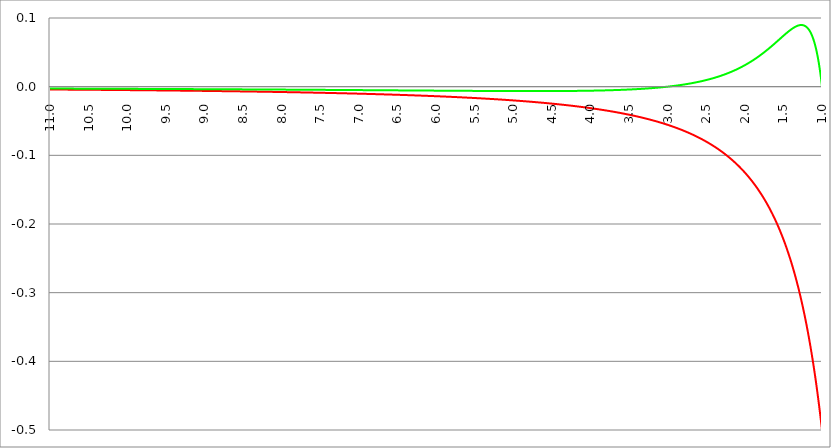
| Category | Series 1 | Series 0 | Series 2 |
|---|---|---|---|
| 11.0 | -0.004 | -0.003 |  |
| 10.995 | -0.004 | -0.003 |  |
| 10.99 | -0.004 | -0.003 |  |
| 10.985 | -0.004 | -0.003 |  |
| 10.98 | -0.004 | -0.003 |  |
| 10.975 | -0.004 | -0.003 |  |
| 10.97 | -0.004 | -0.003 |  |
| 10.96499999999999 | -0.004 | -0.003 |  |
| 10.96 | -0.004 | -0.003 |  |
| 10.955 | -0.004 | -0.003 |  |
| 10.95 | -0.004 | -0.003 |  |
| 10.945 | -0.004 | -0.003 |  |
| 10.94 | -0.004 | -0.003 |  |
| 10.93499999999999 | -0.004 | -0.003 |  |
| 10.92999999999999 | -0.004 | -0.003 |  |
| 10.92499999999999 | -0.004 | -0.003 |  |
| 10.91999999999999 | -0.004 | -0.003 |  |
| 10.91499999999999 | -0.004 | -0.003 |  |
| 10.90999999999999 | -0.004 | -0.003 |  |
| 10.90499999999999 | -0.004 | -0.003 |  |
| 10.89999999999998 | -0.004 | -0.003 |  |
| 10.89499999999998 | -0.004 | -0.003 |  |
| 10.88999999999998 | -0.004 | -0.003 |  |
| 10.88499999999998 | -0.004 | -0.003 |  |
| 10.87999999999998 | -0.004 | -0.003 |  |
| 10.87499999999998 | -0.004 | -0.003 |  |
| 10.86999999999998 | -0.004 | -0.003 |  |
| 10.86499999999998 | -0.004 | -0.003 |  |
| 10.85999999999998 | -0.004 | -0.003 |  |
| 10.85499999999998 | -0.004 | -0.003 |  |
| 10.84999999999998 | -0.004 | -0.003 |  |
| 10.84499999999998 | -0.004 | -0.003 |  |
| 10.83999999999997 | -0.004 | -0.003 |  |
| 10.83499999999997 | -0.004 | -0.003 |  |
| 10.82999999999997 | -0.004 | -0.003 |  |
| 10.82499999999997 | -0.004 | -0.003 |  |
| 10.81999999999997 | -0.004 | -0.003 |  |
| 10.81499999999997 | -0.004 | -0.003 |  |
| 10.80999999999997 | -0.004 | -0.003 |  |
| 10.80499999999997 | -0.004 | -0.003 |  |
| 10.79999999999997 | -0.004 | -0.003 |  |
| 10.79499999999997 | -0.004 | -0.003 |  |
| 10.78999999999997 | -0.004 | -0.003 |  |
| 10.78499999999997 | -0.004 | -0.003 |  |
| 10.77999999999997 | -0.004 | -0.003 |  |
| 10.77499999999996 | -0.004 | -0.003 |  |
| 10.76999999999996 | -0.004 | -0.003 |  |
| 10.76499999999996 | -0.004 | -0.003 |  |
| 10.75999999999996 | -0.004 | -0.003 |  |
| 10.75499999999996 | -0.004 | -0.003 |  |
| 10.74999999999996 | -0.004 | -0.003 |  |
| 10.74499999999996 | -0.004 | -0.003 |  |
| 10.73999999999996 | -0.004 | -0.003 |  |
| 10.73499999999996 | -0.004 | -0.003 |  |
| 10.72999999999996 | -0.004 | -0.003 |  |
| 10.72499999999996 | -0.004 | -0.003 |  |
| 10.71999999999996 | -0.004 | -0.003 |  |
| 10.71499999999996 | -0.004 | -0.003 |  |
| 10.70999999999995 | -0.004 | -0.003 |  |
| 10.70499999999995 | -0.004 | -0.003 |  |
| 10.69999999999995 | -0.004 | -0.003 |  |
| 10.69499999999995 | -0.004 | -0.003 |  |
| 10.68999999999995 | -0.004 | -0.003 |  |
| 10.68499999999995 | -0.004 | -0.003 |  |
| 10.67999999999995 | -0.004 | -0.003 |  |
| 10.67499999999995 | -0.004 | -0.003 |  |
| 10.66999999999995 | -0.004 | -0.003 |  |
| 10.66499999999995 | -0.004 | -0.003 |  |
| 10.65999999999995 | -0.004 | -0.003 |  |
| 10.65499999999995 | -0.004 | -0.003 |  |
| 10.64999999999995 | -0.004 | -0.003 |  |
| 10.64499999999994 | -0.004 | -0.003 |  |
| 10.63999999999994 | -0.004 | -0.003 |  |
| 10.63499999999994 | -0.004 | -0.003 |  |
| 10.62999999999994 | -0.004 | -0.003 |  |
| 10.62499999999994 | -0.004 | -0.003 |  |
| 10.61999999999994 | -0.004 | -0.003 |  |
| 10.61499999999994 | -0.004 | -0.003 |  |
| 10.60999999999994 | -0.004 | -0.003 |  |
| 10.60499999999994 | -0.004 | -0.003 |  |
| 10.59999999999994 | -0.004 | -0.003 |  |
| 10.59499999999994 | -0.004 | -0.003 |  |
| 10.58999999999994 | -0.004 | -0.003 |  |
| 10.58499999999994 | -0.004 | -0.003 |  |
| 10.57999999999993 | -0.004 | -0.003 |  |
| 10.57499999999993 | -0.004 | -0.003 |  |
| 10.56999999999993 | -0.004 | -0.003 |  |
| 10.56499999999993 | -0.004 | -0.003 |  |
| 10.55999999999993 | -0.004 | -0.003 |  |
| 10.55499999999993 | -0.004 | -0.003 |  |
| 10.54999999999993 | -0.004 | -0.003 |  |
| 10.54499999999993 | -0.004 | -0.003 |  |
| 10.53999999999993 | -0.005 | -0.003 |  |
| 10.53499999999993 | -0.005 | -0.003 |  |
| 10.52999999999993 | -0.005 | -0.003 |  |
| 10.52499999999993 | -0.005 | -0.003 |  |
| 10.51999999999992 | -0.005 | -0.003 |  |
| 10.51499999999992 | -0.005 | -0.003 |  |
| 10.50999999999992 | -0.005 | -0.003 |  |
| 10.50499999999992 | -0.005 | -0.003 |  |
| 10.49999999999992 | -0.005 | -0.003 |  |
| 10.49499999999992 | -0.005 | -0.003 |  |
| 10.48999999999992 | -0.005 | -0.003 |  |
| 10.48499999999992 | -0.005 | -0.003 |  |
| 10.47999999999992 | -0.005 | -0.003 |  |
| 10.47499999999992 | -0.005 | -0.003 |  |
| 10.46999999999992 | -0.005 | -0.003 |  |
| 10.46499999999992 | -0.005 | -0.003 |  |
| 10.45999999999992 | -0.005 | -0.003 |  |
| 10.45499999999991 | -0.005 | -0.003 |  |
| 10.44999999999991 | -0.005 | -0.003 |  |
| 10.44499999999991 | -0.005 | -0.003 |  |
| 10.43999999999991 | -0.005 | -0.003 |  |
| 10.43499999999991 | -0.005 | -0.003 |  |
| 10.42999999999991 | -0.005 | -0.003 |  |
| 10.42499999999991 | -0.005 | -0.003 |  |
| 10.41999999999991 | -0.005 | -0.003 |  |
| 10.41499999999991 | -0.005 | -0.003 |  |
| 10.40999999999991 | -0.005 | -0.003 |  |
| 10.40499999999991 | -0.005 | -0.003 |  |
| 10.39999999999991 | -0.005 | -0.003 |  |
| 10.39499999999991 | -0.005 | -0.003 |  |
| 10.3899999999999 | -0.005 | -0.003 |  |
| 10.3849999999999 | -0.005 | -0.003 |  |
| 10.3799999999999 | -0.005 | -0.003 |  |
| 10.3749999999999 | -0.005 | -0.003 |  |
| 10.3699999999999 | -0.005 | -0.003 |  |
| 10.3649999999999 | -0.005 | -0.003 |  |
| 10.3599999999999 | -0.005 | -0.003 |  |
| 10.3549999999999 | -0.005 | -0.003 |  |
| 10.3499999999999 | -0.005 | -0.003 |  |
| 10.3449999999999 | -0.005 | -0.003 |  |
| 10.3399999999999 | -0.005 | -0.003 |  |
| 10.3349999999999 | -0.005 | -0.003 |  |
| 10.3299999999999 | -0.005 | -0.003 |  |
| 10.32499999999989 | -0.005 | -0.003 |  |
| 10.31999999999989 | -0.005 | -0.003 |  |
| 10.31499999999989 | -0.005 | -0.003 |  |
| 10.3099999999999 | -0.005 | -0.003 |  |
| 10.3049999999999 | -0.005 | -0.003 |  |
| 10.2999999999999 | -0.005 | -0.003 |  |
| 10.29499999999989 | -0.005 | -0.003 |  |
| 10.28999999999989 | -0.005 | -0.003 |  |
| 10.28499999999989 | -0.005 | -0.003 |  |
| 10.27999999999989 | -0.005 | -0.003 |  |
| 10.27499999999989 | -0.005 | -0.003 |  |
| 10.26999999999989 | -0.005 | -0.003 |  |
| 10.26499999999989 | -0.005 | -0.003 |  |
| 10.25999999999988 | -0.005 | -0.003 |  |
| 10.25499999999988 | -0.005 | -0.003 |  |
| 10.24999999999988 | -0.005 | -0.003 |  |
| 10.24499999999988 | -0.005 | -0.003 |  |
| 10.23999999999988 | -0.005 | -0.003 |  |
| 10.23499999999988 | -0.005 | -0.003 |  |
| 10.22999999999988 | -0.005 | -0.003 |  |
| 10.22499999999988 | -0.005 | -0.003 |  |
| 10.21999999999988 | -0.005 | -0.003 |  |
| 10.21499999999988 | -0.005 | -0.003 |  |
| 10.20999999999988 | -0.005 | -0.003 |  |
| 10.20499999999988 | -0.005 | -0.003 |  |
| 10.19999999999987 | -0.005 | -0.003 |  |
| 10.19499999999987 | -0.005 | -0.003 |  |
| 10.18999999999987 | -0.005 | -0.003 |  |
| 10.18499999999987 | -0.005 | -0.003 |  |
| 10.17999999999987 | -0.005 | -0.003 |  |
| 10.17499999999987 | -0.005 | -0.003 |  |
| 10.16999999999987 | -0.005 | -0.003 |  |
| 10.16499999999987 | -0.005 | -0.003 |  |
| 10.15999999999987 | -0.005 | -0.003 |  |
| 10.15499999999987 | -0.005 | -0.003 |  |
| 10.14999999999987 | -0.005 | -0.003 |  |
| 10.14499999999987 | -0.005 | -0.003 |  |
| 10.13999999999987 | -0.005 | -0.003 |  |
| 10.13499999999986 | -0.005 | -0.003 |  |
| 10.12999999999986 | -0.005 | -0.003 |  |
| 10.12499999999986 | -0.005 | -0.003 |  |
| 10.11999999999986 | -0.005 | -0.003 |  |
| 10.11499999999986 | -0.005 | -0.003 |  |
| 10.10999999999986 | -0.005 | -0.003 |  |
| 10.10499999999986 | -0.005 | -0.003 |  |
| 10.09999999999986 | -0.005 | -0.003 |  |
| 10.09499999999986 | -0.005 | -0.003 |  |
| 10.08999999999986 | -0.005 | -0.003 |  |
| 10.08499999999986 | -0.005 | -0.003 |  |
| 10.07999999999986 | -0.005 | -0.003 |  |
| 10.07499999999986 | -0.005 | -0.003 |  |
| 10.06999999999985 | -0.005 | -0.003 |  |
| 10.06499999999985 | -0.005 | -0.003 |  |
| 10.05999999999985 | -0.005 | -0.003 |  |
| 10.05499999999985 | -0.005 | -0.003 |  |
| 10.04999999999985 | -0.005 | -0.003 |  |
| 10.04499999999985 | -0.005 | -0.003 |  |
| 10.03999999999985 | -0.005 | -0.003 |  |
| 10.03499999999985 | -0.005 | -0.003 |  |
| 10.02999999999985 | -0.005 | -0.003 |  |
| 10.02499999999985 | -0.005 | -0.003 |  |
| 10.01999999999985 | -0.005 | -0.003 |  |
| 10.01499999999985 | -0.005 | -0.003 |  |
| 10.00999999999985 | -0.005 | -0.003 |  |
| 10.00499999999984 | -0.005 | -0.003 |  |
| 9.999999999999844 | -0.005 | -0.003 |  |
| 9.994999999999841 | -0.005 | -0.003 |  |
| 9.98999999999984 | -0.005 | -0.003 |  |
| 9.98499999999984 | -0.005 | -0.003 |  |
| 9.97999999999984 | -0.005 | -0.003 |  |
| 9.97499999999984 | -0.005 | -0.003 |  |
| 9.969999999999837 | -0.005 | -0.003 |  |
| 9.964999999999838 | -0.005 | -0.003 |  |
| 9.959999999999837 | -0.005 | -0.003 |  |
| 9.954999999999837 | -0.005 | -0.003 |  |
| 9.949999999999836 | -0.005 | -0.003 |  |
| 9.944999999999835 | -0.005 | -0.003 |  |
| 9.939999999999834 | -0.005 | -0.003 |  |
| 9.934999999999834 | -0.005 | -0.003 |  |
| 9.929999999999833 | -0.005 | -0.003 |  |
| 9.92499999999983 | -0.005 | -0.003 |  |
| 9.91999999999983 | -0.005 | -0.003 |  |
| 9.91499999999983 | -0.005 | -0.003 |  |
| 9.90999999999983 | -0.005 | -0.003 |  |
| 9.904999999999829 | -0.005 | -0.003 |  |
| 9.899999999999826 | -0.005 | -0.003 |  |
| 9.894999999999827 | -0.005 | -0.003 |  |
| 9.889999999999826 | -0.005 | -0.003 |  |
| 9.884999999999826 | -0.005 | -0.003 |  |
| 9.879999999999823 | -0.005 | -0.003 |  |
| 9.874999999999824 | -0.005 | -0.003 |  |
| 9.869999999999823 | -0.005 | -0.003 |  |
| 9.864999999999823 | -0.005 | -0.003 |  |
| 9.85999999999982 | -0.005 | -0.003 |  |
| 9.85499999999982 | -0.005 | -0.003 |  |
| 9.84999999999982 | -0.005 | -0.003 |  |
| 9.84499999999982 | -0.005 | -0.003 |  |
| 9.839999999999819 | -0.005 | -0.003 |  |
| 9.834999999999818 | -0.005 | -0.003 |  |
| 9.829999999999817 | -0.005 | -0.003 |  |
| 9.824999999999816 | -0.005 | -0.003 |  |
| 9.819999999999816 | -0.005 | -0.003 |  |
| 9.814999999999815 | -0.005 | -0.003 |  |
| 9.809999999999812 | -0.005 | -0.003 |  |
| 9.804999999999813 | -0.005 | -0.003 |  |
| 9.799999999999812 | -0.005 | -0.003 |  |
| 9.794999999999812 | -0.005 | -0.003 |  |
| 9.78999999999981 | -0.005 | -0.003 |  |
| 9.78499999999981 | -0.005 | -0.003 |  |
| 9.77999999999981 | -0.005 | -0.003 |  |
| 9.774999999999809 | -0.005 | -0.003 |  |
| 9.769999999999808 | -0.005 | -0.003 |  |
| 9.764999999999807 | -0.005 | -0.003 |  |
| 9.759999999999806 | -0.005 | -0.003 |  |
| 9.754999999999805 | -0.005 | -0.003 |  |
| 9.749999999999805 | -0.005 | -0.003 |  |
| 9.744999999999804 | -0.005 | -0.003 |  |
| 9.739999999999803 | -0.005 | -0.003 |  |
| 9.734999999999802 | -0.005 | -0.003 |  |
| 9.729999999999801 | -0.005 | -0.003 |  |
| 9.7249999999998 | -0.005 | -0.003 |  |
| 9.7199999999998 | -0.005 | -0.003 |  |
| 9.7149999999998 | -0.005 | -0.003 |  |
| 9.709999999999798 | -0.005 | -0.003 |  |
| 9.704999999999798 | -0.005 | -0.003 |  |
| 9.699999999999797 | -0.005 | -0.003 |  |
| 9.694999999999794 | -0.005 | -0.003 |  |
| 9.689999999999795 | -0.005 | -0.003 |  |
| 9.684999999999794 | -0.005 | -0.003 |  |
| 9.679999999999794 | -0.005 | -0.003 |  |
| 9.674999999999793 | -0.005 | -0.003 |  |
| 9.66999999999979 | -0.005 | -0.003 |  |
| 9.66499999999979 | -0.005 | -0.003 |  |
| 9.65999999999979 | -0.005 | -0.003 |  |
| 9.65499999999979 | -0.005 | -0.003 |  |
| 9.649999999999787 | -0.005 | -0.003 |  |
| 9.644999999999788 | -0.005 | -0.003 |  |
| 9.639999999999787 | -0.005 | -0.003 |  |
| 9.634999999999787 | -0.005 | -0.003 |  |
| 9.629999999999786 | -0.005 | -0.003 |  |
| 9.624999999999785 | -0.005 | -0.003 |  |
| 9.619999999999784 | -0.005 | -0.003 |  |
| 9.614999999999783 | -0.005 | -0.003 |  |
| 9.609999999999783 | -0.005 | -0.003 |  |
| 9.60499999999978 | -0.005 | -0.003 |  |
| 9.59999999999978 | -0.005 | -0.003 |  |
| 9.59499999999978 | -0.005 | -0.003 |  |
| 9.58999999999978 | -0.005 | -0.003 |  |
| 9.584999999999779 | -0.005 | -0.003 |  |
| 9.579999999999778 | -0.005 | -0.003 |  |
| 9.574999999999777 | -0.005 | -0.003 |  |
| 9.569999999999776 | -0.005 | -0.003 |  |
| 9.564999999999776 | -0.005 | -0.003 |  |
| 9.559999999999773 | -0.005 | -0.003 |  |
| 9.554999999999774 | -0.005 | -0.003 |  |
| 9.549999999999773 | -0.005 | -0.003 |  |
| 9.544999999999773 | -0.005 | -0.003 |  |
| 9.539999999999772 | -0.005 | -0.003 |  |
| 9.534999999999771 | -0.005 | -0.003 |  |
| 9.52999999999977 | -0.006 | -0.003 |  |
| 9.52499999999977 | -0.006 | -0.003 |  |
| 9.519999999999769 | -0.006 | -0.003 |  |
| 9.514999999999768 | -0.006 | -0.003 |  |
| 9.509999999999767 | -0.006 | -0.003 |  |
| 9.504999999999766 | -0.006 | -0.003 |  |
| 9.499999999999766 | -0.006 | -0.003 |  |
| 9.494999999999765 | -0.006 | -0.003 |  |
| 9.489999999999762 | -0.006 | -0.003 |  |
| 9.484999999999763 | -0.006 | -0.003 |  |
| 9.47999999999976 | -0.006 | -0.003 |  |
| 9.47499999999976 | -0.006 | -0.003 |  |
| 9.46999999999976 | -0.006 | -0.003 |  |
| 9.46499999999976 | -0.006 | -0.003 |  |
| 9.45999999999976 | -0.006 | -0.003 |  |
| 9.454999999999758 | -0.006 | -0.003 |  |
| 9.449999999999758 | -0.006 | -0.003 |  |
| 9.444999999999757 | -0.006 | -0.003 |  |
| 9.439999999999756 | -0.006 | -0.003 |  |
| 9.434999999999755 | -0.006 | -0.003 |  |
| 9.429999999999755 | -0.006 | -0.003 |  |
| 9.424999999999754 | -0.006 | -0.003 |  |
| 9.419999999999751 | -0.006 | -0.003 |  |
| 9.414999999999752 | -0.006 | -0.003 |  |
| 9.40999999999975 | -0.006 | -0.003 |  |
| 9.40499999999975 | -0.006 | -0.003 |  |
| 9.39999999999975 | -0.006 | -0.003 |  |
| 9.39499999999975 | -0.006 | -0.003 |  |
| 9.389999999999748 | -0.006 | -0.003 |  |
| 9.384999999999748 | -0.006 | -0.003 |  |
| 9.379999999999747 | -0.006 | -0.003 |  |
| 9.374999999999744 | -0.006 | -0.003 |  |
| 9.369999999999745 | -0.006 | -0.003 |  |
| 9.364999999999744 | -0.006 | -0.003 |  |
| 9.35999999999974 | -0.006 | -0.003 |  |
| 9.35499999999974 | -0.006 | -0.003 |  |
| 9.34999999999974 | -0.006 | -0.003 |  |
| 9.34499999999974 | -0.006 | -0.003 |  |
| 9.33999999999974 | -0.006 | -0.003 |  |
| 9.33499999999974 | -0.006 | -0.003 |  |
| 9.329999999999737 | -0.006 | -0.003 |  |
| 9.324999999999738 | -0.006 | -0.003 |  |
| 9.319999999999737 | -0.006 | -0.003 |  |
| 9.314999999999737 | -0.006 | -0.003 |  |
| 9.309999999999736 | -0.006 | -0.003 |  |
| 9.304999999999733 | -0.006 | -0.003 |  |
| 9.299999999999734 | -0.006 | -0.003 |  |
| 9.294999999999733 | -0.006 | -0.003 |  |
| 9.289999999999733 | -0.006 | -0.004 |  |
| 9.28499999999973 | -0.006 | -0.004 |  |
| 9.27999999999973 | -0.006 | -0.004 |  |
| 9.27499999999973 | -0.006 | -0.004 |  |
| 9.26999999999973 | -0.006 | -0.004 |  |
| 9.264999999999729 | -0.006 | -0.004 |  |
| 9.259999999999726 | -0.006 | -0.004 |  |
| 9.254999999999727 | -0.006 | -0.004 |  |
| 9.249999999999726 | -0.006 | -0.004 |  |
| 9.244999999999726 | -0.006 | -0.004 |  |
| 9.239999999999725 | -0.006 | -0.004 |  |
| 9.234999999999724 | -0.006 | -0.004 |  |
| 9.229999999999723 | -0.006 | -0.004 |  |
| 9.224999999999723 | -0.006 | -0.004 |  |
| 9.219999999999722 | -0.006 | -0.004 |  |
| 9.214999999999721 | -0.006 | -0.004 |  |
| 9.20999999999972 | -0.006 | -0.004 |  |
| 9.20499999999972 | -0.006 | -0.004 |  |
| 9.199999999999719 | -0.006 | -0.004 |  |
| 9.194999999999718 | -0.006 | -0.004 |  |
| 9.189999999999717 | -0.006 | -0.004 |  |
| 9.184999999999716 | -0.006 | -0.004 |  |
| 9.179999999999715 | -0.006 | -0.004 |  |
| 9.174999999999715 | -0.006 | -0.004 |  |
| 9.169999999999712 | -0.006 | -0.004 |  |
| 9.164999999999713 | -0.006 | -0.004 |  |
| 9.15999999999971 | -0.006 | -0.004 |  |
| 9.15499999999971 | -0.006 | -0.004 |  |
| 9.14999999999971 | -0.006 | -0.004 |  |
| 9.14499999999971 | -0.006 | -0.004 |  |
| 9.13999999999971 | -0.006 | -0.004 |  |
| 9.134999999999708 | -0.006 | -0.004 |  |
| 9.129999999999708 | -0.006 | -0.004 |  |
| 9.124999999999707 | -0.006 | -0.004 |  |
| 9.119999999999706 | -0.006 | -0.004 |  |
| 9.114999999999705 | -0.006 | -0.004 |  |
| 9.109999999999705 | -0.006 | -0.004 |  |
| 9.104999999999704 | -0.006 | -0.004 |  |
| 9.099999999999701 | -0.006 | -0.004 |  |
| 9.094999999999702 | -0.006 | -0.004 |  |
| 9.0899999999997 | -0.006 | -0.004 |  |
| 9.0849999999997 | -0.006 | -0.004 |  |
| 9.0799999999997 | -0.006 | -0.004 |  |
| 9.0749999999997 | -0.006 | -0.004 |  |
| 9.069999999999698 | -0.006 | -0.004 |  |
| 9.064999999999698 | -0.006 | -0.004 |  |
| 9.059999999999697 | -0.006 | -0.004 |  |
| 9.054999999999694 | -0.006 | -0.004 |  |
| 9.049999999999695 | -0.006 | -0.004 |  |
| 9.044999999999694 | -0.006 | -0.004 |  |
| 9.039999999999694 | -0.006 | -0.004 |  |
| 9.034999999999693 | -0.006 | -0.004 |  |
| 9.02999999999969 | -0.006 | -0.004 |  |
| 9.02499999999969 | -0.006 | -0.004 |  |
| 9.01999999999969 | -0.006 | -0.004 |  |
| 9.01499999999969 | -0.006 | -0.004 |  |
| 9.009999999999687 | -0.006 | -0.004 |  |
| 9.004999999999688 | -0.006 | -0.004 |  |
| 8.999999999999687 | -0.006 | -0.004 |  |
| 8.994999999999687 | -0.006 | -0.004 |  |
| 8.989999999999686 | -0.006 | -0.004 |  |
| 8.984999999999683 | -0.006 | -0.004 |  |
| 8.979999999999684 | -0.006 | -0.004 |  |
| 8.974999999999683 | -0.006 | -0.004 |  |
| 8.96999999999968 | -0.006 | -0.004 |  |
| 8.96499999999968 | -0.006 | -0.004 |  |
| 8.95999999999968 | -0.006 | -0.004 |  |
| 8.95499999999968 | -0.006 | -0.004 |  |
| 8.94999999999968 | -0.006 | -0.004 |  |
| 8.944999999999679 | -0.006 | -0.004 |  |
| 8.939999999999676 | -0.006 | -0.004 |  |
| 8.934999999999677 | -0.006 | -0.004 |  |
| 8.929999999999676 | -0.006 | -0.004 |  |
| 8.924999999999676 | -0.006 | -0.004 |  |
| 8.919999999999675 | -0.006 | -0.004 |  |
| 8.914999999999674 | -0.006 | -0.004 |  |
| 8.909999999999673 | -0.006 | -0.004 |  |
| 8.904999999999673 | -0.006 | -0.004 |  |
| 8.89999999999967 | -0.006 | -0.004 |  |
| 8.89499999999967 | -0.006 | -0.004 |  |
| 8.88999999999967 | -0.006 | -0.004 |  |
| 8.88499999999967 | -0.006 | -0.004 |  |
| 8.879999999999669 | -0.006 | -0.004 |  |
| 8.874999999999668 | -0.006 | -0.004 |  |
| 8.869999999999665 | -0.006 | -0.004 |  |
| 8.864999999999666 | -0.006 | -0.004 |  |
| 8.859999999999665 | -0.006 | -0.004 |  |
| 8.854999999999665 | -0.006 | -0.004 |  |
| 8.849999999999662 | -0.006 | -0.004 |  |
| 8.844999999999663 | -0.006 | -0.004 |  |
| 8.83999999999966 | -0.006 | -0.004 |  |
| 8.83499999999966 | -0.006 | -0.004 |  |
| 8.82999999999966 | -0.006 | -0.004 |  |
| 8.82499999999966 | -0.006 | -0.004 |  |
| 8.81999999999966 | -0.006 | -0.004 |  |
| 8.814999999999658 | -0.006 | -0.004 |  |
| 8.809999999999658 | -0.006 | -0.004 |  |
| 8.804999999999657 | -0.006 | -0.004 |  |
| 8.799999999999656 | -0.006 | -0.004 |  |
| 8.794999999999655 | -0.006 | -0.004 |  |
| 8.789999999999655 | -0.006 | -0.004 |  |
| 8.784999999999654 | -0.006 | -0.004 |  |
| 8.779999999999651 | -0.006 | -0.004 |  |
| 8.774999999999652 | -0.006 | -0.004 |  |
| 8.76999999999965 | -0.007 | -0.004 |  |
| 8.76499999999965 | -0.007 | -0.004 |  |
| 8.75999999999965 | -0.007 | -0.004 |  |
| 8.754999999999647 | -0.007 | -0.004 |  |
| 8.749999999999648 | -0.007 | -0.004 |  |
| 8.744999999999647 | -0.007 | -0.004 |  |
| 8.739999999999647 | -0.007 | -0.004 |  |
| 8.734999999999644 | -0.007 | -0.004 |  |
| 8.729999999999645 | -0.007 | -0.004 |  |
| 8.724999999999644 | -0.007 | -0.004 |  |
| 8.719999999999644 | -0.007 | -0.004 |  |
| 8.714999999999643 | -0.007 | -0.004 |  |
| 8.70999999999964 | -0.007 | -0.004 |  |
| 8.70499999999964 | -0.007 | -0.004 |  |
| 8.69999999999964 | -0.007 | -0.004 |  |
| 8.69499999999964 | -0.007 | -0.004 |  |
| 8.689999999999637 | -0.007 | -0.004 |  |
| 8.684999999999638 | -0.007 | -0.004 |  |
| 8.679999999999637 | -0.007 | -0.004 |  |
| 8.674999999999637 | -0.007 | -0.004 |  |
| 8.669999999999636 | -0.007 | -0.004 |  |
| 8.664999999999633 | -0.007 | -0.004 |  |
| 8.659999999999634 | -0.007 | -0.004 |  |
| 8.654999999999633 | -0.007 | -0.004 |  |
| 8.649999999999633 | -0.007 | -0.004 |  |
| 8.644999999999632 | -0.007 | -0.004 |  |
| 8.63999999999963 | -0.007 | -0.004 |  |
| 8.63499999999963 | -0.007 | -0.004 |  |
| 8.62999999999963 | -0.007 | -0.004 |  |
| 8.624999999999629 | -0.007 | -0.004 |  |
| 8.619999999999626 | -0.007 | -0.004 |  |
| 8.614999999999627 | -0.007 | -0.004 |  |
| 8.609999999999626 | -0.007 | -0.004 |  |
| 8.604999999999626 | -0.007 | -0.004 |  |
| 8.599999999999625 | -0.007 | -0.004 |  |
| 8.594999999999624 | -0.007 | -0.004 |  |
| 8.589999999999623 | -0.007 | -0.004 |  |
| 8.584999999999622 | -0.007 | -0.004 |  |
| 8.57999999999962 | -0.007 | -0.004 |  |
| 8.57499999999962 | -0.007 | -0.004 |  |
| 8.56999999999962 | -0.007 | -0.004 |  |
| 8.56499999999962 | -0.007 | -0.004 |  |
| 8.559999999999619 | -0.007 | -0.004 |  |
| 8.554999999999618 | -0.007 | -0.004 |  |
| 8.549999999999617 | -0.007 | -0.004 |  |
| 8.544999999999616 | -0.007 | -0.004 |  |
| 8.539999999999615 | -0.007 | -0.004 |  |
| 8.534999999999615 | -0.007 | -0.004 |  |
| 8.529999999999612 | -0.007 | -0.004 |  |
| 8.524999999999613 | -0.007 | -0.004 |  |
| 8.51999999999961 | -0.007 | -0.004 |  |
| 8.51499999999961 | -0.007 | -0.004 |  |
| 8.50999999999961 | -0.007 | -0.004 |  |
| 8.50499999999961 | -0.007 | -0.004 |  |
| 8.49999999999961 | -0.007 | -0.004 |  |
| 8.494999999999608 | -0.007 | -0.004 |  |
| 8.489999999999608 | -0.007 | -0.004 |  |
| 8.484999999999607 | -0.007 | -0.004 |  |
| 8.479999999999606 | -0.007 | -0.004 |  |
| 8.474999999999605 | -0.007 | -0.004 |  |
| 8.469999999999605 | -0.007 | -0.004 |  |
| 8.464999999999604 | -0.007 | -0.004 |  |
| 8.4599999999996 | -0.007 | -0.004 |  |
| 8.4549999999996 | -0.007 | -0.004 |  |
| 8.4499999999996 | -0.007 | -0.004 |  |
| 8.4449999999996 | -0.007 | -0.004 |  |
| 8.4399999999996 | -0.007 | -0.004 |  |
| 8.4349999999996 | -0.007 | -0.004 |  |
| 8.429999999999598 | -0.007 | -0.004 |  |
| 8.424999999999597 | -0.007 | -0.004 |  |
| 8.419999999999597 | -0.007 | -0.004 |  |
| 8.414999999999594 | -0.007 | -0.004 |  |
| 8.409999999999595 | -0.007 | -0.004 |  |
| 8.404999999999594 | -0.007 | -0.004 |  |
| 8.399999999999594 | -0.007 | -0.004 |  |
| 8.394999999999593 | -0.007 | -0.004 |  |
| 8.38999999999959 | -0.007 | -0.004 |  |
| 8.38499999999959 | -0.007 | -0.004 |  |
| 8.37999999999959 | -0.007 | -0.004 |  |
| 8.37499999999959 | -0.007 | -0.004 |  |
| 8.369999999999589 | -0.007 | -0.004 |  |
| 8.364999999999588 | -0.007 | -0.004 |  |
| 8.359999999999587 | -0.007 | -0.004 |  |
| 8.354999999999587 | -0.007 | -0.004 |  |
| 8.349999999999586 | -0.007 | -0.004 |  |
| 8.344999999999585 | -0.007 | -0.004 |  |
| 8.339999999999584 | -0.007 | -0.004 |  |
| 8.334999999999583 | -0.007 | -0.004 |  |
| 8.329999999999583 | -0.007 | -0.004 |  |
| 8.324999999999582 | -0.007 | -0.004 |  |
| 8.31999999999958 | -0.007 | -0.004 |  |
| 8.31499999999958 | -0.007 | -0.004 |  |
| 8.30999999999958 | -0.007 | -0.004 |  |
| 8.304999999999579 | -0.007 | -0.004 |  |
| 8.299999999999578 | -0.007 | -0.004 |  |
| 8.294999999999577 | -0.007 | -0.004 |  |
| 8.289999999999576 | -0.007 | -0.004 |  |
| 8.284999999999576 | -0.007 | -0.004 |  |
| 8.279999999999575 | -0.007 | -0.004 |  |
| 8.274999999999574 | -0.007 | -0.004 |  |
| 8.269999999999573 | -0.007 | -0.004 |  |
| 8.264999999999572 | -0.007 | -0.004 |  |
| 8.259999999999572 | -0.007 | -0.004 |  |
| 8.254999999999571 | -0.007 | -0.004 |  |
| 8.24999999999957 | -0.007 | -0.004 |  |
| 8.24499999999957 | -0.007 | -0.004 |  |
| 8.239999999999569 | -0.007 | -0.004 |  |
| 8.234999999999568 | -0.007 | -0.004 |  |
| 8.229999999999567 | -0.007 | -0.004 |  |
| 8.224999999999566 | -0.007 | -0.004 |  |
| 8.219999999999565 | -0.007 | -0.004 |  |
| 8.214999999999565 | -0.007 | -0.004 |  |
| 8.209999999999564 | -0.007 | -0.004 |  |
| 8.204999999999563 | -0.007 | -0.004 |  |
| 8.199999999999562 | -0.007 | -0.004 |  |
| 8.194999999999562 | -0.007 | -0.004 |  |
| 8.18999999999956 | -0.007 | -0.004 |  |
| 8.18499999999956 | -0.007 | -0.004 |  |
| 8.17999999999956 | -0.007 | -0.004 |  |
| 8.174999999999558 | -0.007 | -0.004 |  |
| 8.169999999999558 | -0.007 | -0.004 |  |
| 8.164999999999557 | -0.007 | -0.004 |  |
| 8.159999999999556 | -0.008 | -0.004 |  |
| 8.154999999999555 | -0.008 | -0.004 |  |
| 8.149999999999554 | -0.008 | -0.004 |  |
| 8.144999999999554 | -0.008 | -0.004 |  |
| 8.139999999999553 | -0.008 | -0.004 |  |
| 8.134999999999552 | -0.008 | -0.004 |  |
| 8.129999999999551 | -0.008 | -0.004 |  |
| 8.12499999999955 | -0.008 | -0.004 |  |
| 8.11999999999955 | -0.008 | -0.004 |  |
| 8.11499999999955 | -0.008 | -0.004 |  |
| 8.109999999999548 | -0.008 | -0.004 |  |
| 8.104999999999547 | -0.008 | -0.004 |  |
| 8.099999999999547 | -0.008 | -0.004 |  |
| 8.094999999999544 | -0.008 | -0.004 |  |
| 8.089999999999545 | -0.008 | -0.004 |  |
| 8.084999999999544 | -0.008 | -0.004 |  |
| 8.079999999999544 | -0.008 | -0.004 |  |
| 8.074999999999543 | -0.008 | -0.004 |  |
| 8.06999999999954 | -0.008 | -0.004 |  |
| 8.06499999999954 | -0.008 | -0.004 |  |
| 8.05999999999954 | -0.008 | -0.004 |  |
| 8.05499999999954 | -0.008 | -0.004 |  |
| 8.049999999999539 | -0.008 | -0.004 |  |
| 8.044999999999538 | -0.008 | -0.004 |  |
| 8.039999999999537 | -0.008 | -0.004 |  |
| 8.034999999999537 | -0.008 | -0.004 |  |
| 8.029999999999536 | -0.008 | -0.004 |  |
| 8.024999999999535 | -0.008 | -0.004 |  |
| 8.019999999999534 | -0.008 | -0.004 |  |
| 8.014999999999533 | -0.008 | -0.004 |  |
| 8.009999999999533 | -0.008 | -0.004 |  |
| 8.004999999999532 | -0.008 | -0.004 |  |
| 7.999999999999531 | -0.008 | -0.004 |  |
| 7.994999999999532 | -0.008 | -0.004 |  |
| 7.989999999999532 | -0.008 | -0.004 |  |
| 7.984999999999532 | -0.008 | -0.004 |  |
| 7.979999999999532 | -0.008 | -0.004 |  |
| 7.974999999999532 | -0.008 | -0.004 |  |
| 7.969999999999532 | -0.008 | -0.004 |  |
| 7.964999999999533 | -0.008 | -0.004 |  |
| 7.959999999999532 | -0.008 | -0.004 |  |
| 7.954999999999533 | -0.008 | -0.004 |  |
| 7.949999999999532 | -0.008 | -0.004 |  |
| 7.944999999999533 | -0.008 | -0.004 |  |
| 7.939999999999533 | -0.008 | -0.004 |  |
| 7.934999999999533 | -0.008 | -0.004 |  |
| 7.929999999999533 | -0.008 | -0.004 |  |
| 7.924999999999534 | -0.008 | -0.004 |  |
| 7.919999999999533 | -0.008 | -0.004 |  |
| 7.914999999999534 | -0.008 | -0.004 |  |
| 7.909999999999533 | -0.008 | -0.004 |  |
| 7.904999999999534 | -0.008 | -0.004 |  |
| 7.899999999999534 | -0.008 | -0.004 |  |
| 7.894999999999534 | -0.008 | -0.004 |  |
| 7.889999999999534 | -0.008 | -0.004 |  |
| 7.884999999999534 | -0.008 | -0.004 |  |
| 7.879999999999534 | -0.008 | -0.004 |  |
| 7.874999999999534 | -0.008 | -0.004 |  |
| 7.869999999999534 | -0.008 | -0.004 |  |
| 7.864999999999535 | -0.008 | -0.004 |  |
| 7.859999999999534 | -0.008 | -0.004 |  |
| 7.854999999999535 | -0.008 | -0.004 |  |
| 7.849999999999535 | -0.008 | -0.004 |  |
| 7.844999999999535 | -0.008 | -0.004 |  |
| 7.839999999999535 | -0.008 | -0.004 |  |
| 7.834999999999535 | -0.008 | -0.004 |  |
| 7.829999999999535 | -0.008 | -0.004 |  |
| 7.824999999999536 | -0.008 | -0.004 |  |
| 7.819999999999535 | -0.008 | -0.004 |  |
| 7.814999999999536 | -0.008 | -0.004 |  |
| 7.809999999999535 | -0.008 | -0.004 |  |
| 7.804999999999536 | -0.008 | -0.004 |  |
| 7.799999999999536 | -0.008 | -0.004 |  |
| 7.794999999999536 | -0.008 | -0.004 |  |
| 7.789999999999536 | -0.008 | -0.004 |  |
| 7.784999999999536 | -0.008 | -0.004 |  |
| 7.779999999999536 | -0.008 | -0.004 |  |
| 7.774999999999536 | -0.008 | -0.004 |  |
| 7.769999999999536 | -0.008 | -0.004 |  |
| 7.764999999999537 | -0.008 | -0.004 |  |
| 7.759999999999536 | -0.008 | -0.004 |  |
| 7.754999999999537 | -0.008 | -0.004 |  |
| 7.749999999999537 | -0.008 | -0.004 |  |
| 7.744999999999537 | -0.008 | -0.004 |  |
| 7.739999999999537 | -0.008 | -0.004 |  |
| 7.734999999999537 | -0.008 | -0.004 |  |
| 7.729999999999537 | -0.008 | -0.004 |  |
| 7.724999999999538 | -0.008 | -0.004 |  |
| 7.719999999999537 | -0.008 | -0.004 |  |
| 7.714999999999538 | -0.008 | -0.004 |  |
| 7.709999999999538 | -0.008 | -0.004 |  |
| 7.704999999999538 | -0.008 | -0.004 |  |
| 7.699999999999538 | -0.008 | -0.004 |  |
| 7.694999999999538 | -0.008 | -0.004 |  |
| 7.689999999999538 | -0.008 | -0.004 |  |
| 7.684999999999539 | -0.008 | -0.004 |  |
| 7.679999999999538 | -0.008 | -0.004 |  |
| 7.674999999999539 | -0.008 | -0.004 |  |
| 7.669999999999539 | -0.008 | -0.005 |  |
| 7.664999999999539 | -0.009 | -0.005 |  |
| 7.65999999999954 | -0.009 | -0.005 |  |
| 7.654999999999539 | -0.009 | -0.005 |  |
| 7.64999999999954 | -0.009 | -0.005 |  |
| 7.644999999999539 | -0.009 | -0.005 |  |
| 7.63999999999954 | -0.009 | -0.005 |  |
| 7.63499999999954 | -0.009 | -0.005 |  |
| 7.62999999999954 | -0.009 | -0.005 |  |
| 7.62499999999954 | -0.009 | -0.005 |  |
| 7.61999999999954 | -0.009 | -0.005 |  |
| 7.61499999999954 | -0.009 | -0.005 |  |
| 7.60999999999954 | -0.009 | -0.005 |  |
| 7.60499999999954 | -0.009 | -0.005 |  |
| 7.59999999999954 | -0.009 | -0.005 |  |
| 7.594999999999541 | -0.009 | -0.005 |  |
| 7.58999999999954 | -0.009 | -0.005 |  |
| 7.584999999999541 | -0.009 | -0.005 |  |
| 7.57999999999954 | -0.009 | -0.005 |  |
| 7.574999999999541 | -0.009 | -0.005 |  |
| 7.569999999999541 | -0.009 | -0.005 |  |
| 7.564999999999541 | -0.009 | -0.005 |  |
| 7.559999999999541 | -0.009 | -0.005 |  |
| 7.554999999999541 | -0.009 | -0.005 |  |
| 7.549999999999541 | -0.009 | -0.005 |  |
| 7.544999999999542 | -0.009 | -0.005 |  |
| 7.539999999999541 | -0.009 | -0.005 |  |
| 7.534999999999542 | -0.009 | -0.005 |  |
| 7.529999999999542 | -0.009 | -0.005 |  |
| 7.524999999999542 | -0.009 | -0.005 |  |
| 7.519999999999542 | -0.009 | -0.005 |  |
| 7.514999999999542 | -0.009 | -0.005 |  |
| 7.509999999999542 | -0.009 | -0.005 |  |
| 7.504999999999542 | -0.009 | -0.005 |  |
| 7.499999999999542 | -0.009 | -0.005 |  |
| 7.494999999999543 | -0.009 | -0.005 |  |
| 7.489999999999542 | -0.009 | -0.005 |  |
| 7.484999999999543 | -0.009 | -0.005 |  |
| 7.479999999999542 | -0.009 | -0.005 |  |
| 7.474999999999543 | -0.009 | -0.005 |  |
| 7.469999999999543 | -0.009 | -0.005 |  |
| 7.464999999999543 | -0.009 | -0.005 |  |
| 7.459999999999543 | -0.009 | -0.005 |  |
| 7.454999999999544 | -0.009 | -0.005 |  |
| 7.449999999999543 | -0.009 | -0.005 |  |
| 7.444999999999544 | -0.009 | -0.005 |  |
| 7.439999999999543 | -0.009 | -0.005 |  |
| 7.434999999999544 | -0.009 | -0.005 |  |
| 7.429999999999544 | -0.009 | -0.005 |  |
| 7.424999999999544 | -0.009 | -0.005 |  |
| 7.419999999999544 | -0.009 | -0.005 |  |
| 7.414999999999544 | -0.009 | -0.005 |  |
| 7.409999999999544 | -0.009 | -0.005 |  |
| 7.404999999999544 | -0.009 | -0.005 |  |
| 7.399999999999544 | -0.009 | -0.005 |  |
| 7.394999999999545 | -0.009 | -0.005 |  |
| 7.389999999999544 | -0.009 | -0.005 |  |
| 7.384999999999545 | -0.009 | -0.005 |  |
| 7.379999999999545 | -0.009 | -0.005 |  |
| 7.374999999999545 | -0.009 | -0.005 |  |
| 7.369999999999545 | -0.009 | -0.005 |  |
| 7.364999999999545 | -0.009 | -0.005 |  |
| 7.359999999999545 | -0.009 | -0.005 |  |
| 7.354999999999546 | -0.009 | -0.005 |  |
| 7.349999999999545 | -0.009 | -0.005 |  |
| 7.344999999999546 | -0.009 | -0.005 |  |
| 7.339999999999545 | -0.009 | -0.005 |  |
| 7.334999999999546 | -0.009 | -0.005 |  |
| 7.329999999999546 | -0.009 | -0.005 |  |
| 7.324999999999546 | -0.009 | -0.005 |  |
| 7.319999999999546 | -0.009 | -0.005 |  |
| 7.314999999999546 | -0.009 | -0.005 |  |
| 7.309999999999546 | -0.009 | -0.005 |  |
| 7.304999999999547 | -0.009 | -0.005 |  |
| 7.299999999999546 | -0.009 | -0.005 |  |
| 7.294999999999547 | -0.009 | -0.005 |  |
| 7.289999999999547 | -0.009 | -0.005 |  |
| 7.284999999999547 | -0.009 | -0.005 |  |
| 7.279999999999547 | -0.009 | -0.005 |  |
| 7.274999999999547 | -0.009 | -0.005 |  |
| 7.269999999999547 | -0.009 | -0.005 |  |
| 7.264999999999548 | -0.009 | -0.005 |  |
| 7.259999999999547 | -0.009 | -0.005 |  |
| 7.254999999999548 | -0.009 | -0.005 |  |
| 7.249999999999547 | -0.01 | -0.005 |  |
| 7.244999999999548 | -0.01 | -0.005 |  |
| 7.239999999999548 | -0.01 | -0.005 |  |
| 7.234999999999548 | -0.01 | -0.005 |  |
| 7.229999999999548 | -0.01 | -0.005 |  |
| 7.224999999999548 | -0.01 | -0.005 |  |
| 7.219999999999548 | -0.01 | -0.005 |  |
| 7.214999999999549 | -0.01 | -0.005 |  |
| 7.209999999999548 | -0.01 | -0.005 |  |
| 7.204999999999549 | -0.01 | -0.005 |  |
| 7.199999999999549 | -0.01 | -0.005 |  |
| 7.194999999999549 | -0.01 | -0.005 |  |
| 7.18999999999955 | -0.01 | -0.005 |  |
| 7.184999999999549 | -0.01 | -0.005 |  |
| 7.17999999999955 | -0.01 | -0.005 |  |
| 7.17499999999955 | -0.01 | -0.005 |  |
| 7.16999999999955 | -0.01 | -0.005 |  |
| 7.16499999999955 | -0.01 | -0.005 |  |
| 7.15999999999955 | -0.01 | -0.005 |  |
| 7.15499999999955 | -0.01 | -0.005 |  |
| 7.14999999999955 | -0.01 | -0.005 |  |
| 7.14499999999955 | -0.01 | -0.005 |  |
| 7.13999999999955 | -0.01 | -0.005 |  |
| 7.13499999999955 | -0.01 | -0.005 |  |
| 7.12999999999955 | -0.01 | -0.005 |  |
| 7.124999999999551 | -0.01 | -0.005 |  |
| 7.119999999999551 | -0.01 | -0.005 |  |
| 7.114999999999551 | -0.01 | -0.005 |  |
| 7.109999999999551 | -0.01 | -0.005 |  |
| 7.104999999999551 | -0.01 | -0.005 |  |
| 7.099999999999551 | -0.01 | -0.005 |  |
| 7.094999999999551 | -0.01 | -0.005 |  |
| 7.089999999999551 | -0.01 | -0.005 |  |
| 7.084999999999551 | -0.01 | -0.005 |  |
| 7.079999999999551 | -0.01 | -0.005 |  |
| 7.074999999999552 | -0.01 | -0.005 |  |
| 7.069999999999552 | -0.01 | -0.005 |  |
| 7.064999999999552 | -0.01 | -0.005 |  |
| 7.059999999999552 | -0.01 | -0.005 |  |
| 7.054999999999552 | -0.01 | -0.005 |  |
| 7.049999999999552 | -0.01 | -0.005 |  |
| 7.044999999999552 | -0.01 | -0.005 |  |
| 7.039999999999552 | -0.01 | -0.005 |  |
| 7.034999999999552 | -0.01 | -0.005 |  |
| 7.029999999999553 | -0.01 | -0.005 |  |
| 7.024999999999553 | -0.01 | -0.005 |  |
| 7.019999999999553 | -0.01 | -0.005 |  |
| 7.014999999999553 | -0.01 | -0.005 |  |
| 7.009999999999553 | -0.01 | -0.005 |  |
| 7.004999999999553 | -0.01 | -0.005 |  |
| 6.999999999999553 | -0.01 | -0.005 |  |
| 6.994999999999553 | -0.01 | -0.005 |  |
| 6.989999999999553 | -0.01 | -0.005 |  |
| 6.984999999999554 | -0.01 | -0.005 |  |
| 6.979999999999553 | -0.01 | -0.005 |  |
| 6.974999999999554 | -0.01 | -0.005 |  |
| 6.969999999999554 | -0.01 | -0.005 |  |
| 6.964999999999554 | -0.01 | -0.005 |  |
| 6.959999999999554 | -0.01 | -0.005 |  |
| 6.954999999999554 | -0.01 | -0.005 |  |
| 6.949999999999554 | -0.01 | -0.005 |  |
| 6.944999999999554 | -0.01 | -0.005 |  |
| 6.939999999999554 | -0.01 | -0.005 |  |
| 6.934999999999554 | -0.01 | -0.005 |  |
| 6.929999999999554 | -0.01 | -0.005 |  |
| 6.924999999999555 | -0.01 | -0.005 |  |
| 6.919999999999554 | -0.01 | -0.005 |  |
| 6.914999999999555 | -0.01 | -0.005 |  |
| 6.909999999999555 | -0.01 | -0.005 |  |
| 6.904999999999555 | -0.01 | -0.005 |  |
| 6.899999999999555 | -0.011 | -0.005 |  |
| 6.894999999999555 | -0.011 | -0.005 |  |
| 6.889999999999555 | -0.011 | -0.005 |  |
| 6.884999999999556 | -0.011 | -0.005 |  |
| 6.879999999999555 | -0.011 | -0.005 |  |
| 6.874999999999556 | -0.011 | -0.005 |  |
| 6.869999999999556 | -0.011 | -0.005 |  |
| 6.864999999999556 | -0.011 | -0.005 |  |
| 6.859999999999556 | -0.011 | -0.005 |  |
| 6.854999999999556 | -0.011 | -0.005 |  |
| 6.849999999999556 | -0.011 | -0.005 |  |
| 6.844999999999556 | -0.011 | -0.005 |  |
| 6.839999999999556 | -0.011 | -0.005 |  |
| 6.834999999999557 | -0.011 | -0.005 |  |
| 6.829999999999557 | -0.011 | -0.005 |  |
| 6.824999999999557 | -0.011 | -0.005 |  |
| 6.819999999999557 | -0.011 | -0.005 |  |
| 6.814999999999557 | -0.011 | -0.005 |  |
| 6.809999999999557 | -0.011 | -0.005 |  |
| 6.804999999999557 | -0.011 | -0.005 |  |
| 6.799999999999557 | -0.011 | -0.005 |  |
| 6.794999999999558 | -0.011 | -0.005 |  |
| 6.789999999999557 | -0.011 | -0.005 |  |
| 6.784999999999558 | -0.011 | -0.005 |  |
| 6.779999999999557 | -0.011 | -0.005 |  |
| 6.774999999999558 | -0.011 | -0.005 |  |
| 6.769999999999558 | -0.011 | -0.005 |  |
| 6.764999999999558 | -0.011 | -0.005 |  |
| 6.759999999999558 | -0.011 | -0.005 |  |
| 6.754999999999558 | -0.011 | -0.005 |  |
| 6.749999999999558 | -0.011 | -0.005 |  |
| 6.744999999999559 | -0.011 | -0.005 |  |
| 6.739999999999558 | -0.011 | -0.005 |  |
| 6.734999999999559 | -0.011 | -0.005 |  |
| 6.729999999999559 | -0.011 | -0.005 |  |
| 6.724999999999559 | -0.011 | -0.005 |  |
| 6.71999999999956 | -0.011 | -0.005 |  |
| 6.714999999999559 | -0.011 | -0.005 |  |
| 6.70999999999956 | -0.011 | -0.005 |  |
| 6.704999999999559 | -0.011 | -0.005 |  |
| 6.69999999999956 | -0.011 | -0.005 |  |
| 6.69499999999956 | -0.011 | -0.005 |  |
| 6.68999999999956 | -0.011 | -0.005 |  |
| 6.68499999999956 | -0.011 | -0.005 |  |
| 6.67999999999956 | -0.011 | -0.005 |  |
| 6.67499999999956 | -0.011 | -0.005 |  |
| 6.66999999999956 | -0.011 | -0.005 |  |
| 6.66499999999956 | -0.011 | -0.005 |  |
| 6.65999999999956 | -0.011 | -0.005 |  |
| 6.654999999999561 | -0.011 | -0.005 |  |
| 6.64999999999956 | -0.011 | -0.005 |  |
| 6.644999999999561 | -0.011 | -0.005 |  |
| 6.63999999999956 | -0.011 | -0.005 |  |
| 6.634999999999561 | -0.011 | -0.005 |  |
| 6.629999999999561 | -0.011 | -0.005 |  |
| 6.624999999999561 | -0.011 | -0.005 |  |
| 6.619999999999561 | -0.011 | -0.005 |  |
| 6.614999999999561 | -0.011 | -0.005 |  |
| 6.609999999999561 | -0.011 | -0.005 |  |
| 6.604999999999562 | -0.011 | -0.005 |  |
| 6.599999999999561 | -0.011 | -0.005 |  |
| 6.594999999999562 | -0.011 | -0.005 |  |
| 6.589999999999561 | -0.012 | -0.005 |  |
| 6.584999999999562 | -0.012 | -0.005 |  |
| 6.579999999999562 | -0.012 | -0.005 |  |
| 6.574999999999562 | -0.012 | -0.005 |  |
| 6.569999999999562 | -0.012 | -0.005 |  |
| 6.564999999999563 | -0.012 | -0.005 |  |
| 6.559999999999562 | -0.012 | -0.005 |  |
| 6.554999999999563 | -0.012 | -0.005 |  |
| 6.549999999999562 | -0.012 | -0.005 |  |
| 6.544999999999563 | -0.012 | -0.005 |  |
| 6.539999999999563 | -0.012 | -0.005 |  |
| 6.534999999999563 | -0.012 | -0.005 |  |
| 6.529999999999563 | -0.012 | -0.005 |  |
| 6.524999999999563 | -0.012 | -0.005 |  |
| 6.519999999999563 | -0.012 | -0.005 |  |
| 6.514999999999564 | -0.012 | -0.005 |  |
| 6.509999999999563 | -0.012 | -0.005 |  |
| 6.504999999999564 | -0.012 | -0.005 |  |
| 6.499999999999563 | -0.012 | -0.005 |  |
| 6.494999999999564 | -0.012 | -0.005 |  |
| 6.489999999999564 | -0.012 | -0.005 |  |
| 6.484999999999564 | -0.012 | -0.005 |  |
| 6.479999999999564 | -0.012 | -0.005 |  |
| 6.474999999999564 | -0.012 | -0.005 |  |
| 6.469999999999564 | -0.012 | -0.005 |  |
| 6.464999999999564 | -0.012 | -0.005 |  |
| 6.459999999999564 | -0.012 | -0.005 |  |
| 6.454999999999564 | -0.012 | -0.005 |  |
| 6.449999999999564 | -0.012 | -0.005 |  |
| 6.444999999999565 | -0.012 | -0.005 |  |
| 6.439999999999565 | -0.012 | -0.005 |  |
| 6.434999999999565 | -0.012 | -0.005 |  |
| 6.429999999999565 | -0.012 | -0.005 |  |
| 6.424999999999565 | -0.012 | -0.005 |  |
| 6.419999999999565 | -0.012 | -0.005 |  |
| 6.414999999999565 | -0.012 | -0.005 |  |
| 6.409999999999565 | -0.012 | -0.005 |  |
| 6.404999999999565 | -0.012 | -0.005 |  |
| 6.399999999999565 | -0.012 | -0.005 |  |
| 6.394999999999566 | -0.012 | -0.005 |  |
| 6.389999999999566 | -0.012 | -0.005 |  |
| 6.384999999999566 | -0.012 | -0.005 |  |
| 6.379999999999566 | -0.012 | -0.005 |  |
| 6.374999999999566 | -0.012 | -0.005 |  |
| 6.369999999999566 | -0.012 | -0.005 |  |
| 6.364999999999567 | -0.012 | -0.005 |  |
| 6.359999999999566 | -0.012 | -0.006 |  |
| 6.354999999999567 | -0.012 | -0.006 |  |
| 6.349999999999567 | -0.012 | -0.006 |  |
| 6.344999999999567 | -0.012 | -0.006 |  |
| 6.339999999999567 | -0.012 | -0.006 |  |
| 6.334999999999567 | -0.012 | -0.006 |  |
| 6.329999999999567 | -0.012 | -0.006 |  |
| 6.324999999999568 | -0.012 | -0.006 |  |
| 6.319999999999567 | -0.013 | -0.006 |  |
| 6.314999999999568 | -0.013 | -0.006 |  |
| 6.309999999999567 | -0.013 | -0.006 |  |
| 6.304999999999568 | -0.013 | -0.006 |  |
| 6.299999999999568 | -0.013 | -0.006 |  |
| 6.294999999999568 | -0.013 | -0.006 |  |
| 6.289999999999568 | -0.013 | -0.006 |  |
| 6.284999999999568 | -0.013 | -0.006 |  |
| 6.279999999999568 | -0.013 | -0.006 |  |
| 6.274999999999568 | -0.013 | -0.006 |  |
| 6.269999999999568 | -0.013 | -0.006 |  |
| 6.264999999999569 | -0.013 | -0.006 |  |
| 6.259999999999568 | -0.013 | -0.006 |  |
| 6.25499999999957 | -0.013 | -0.006 |  |
| 6.24999999999957 | -0.013 | -0.006 |  |
| 6.24499999999957 | -0.013 | -0.006 |  |
| 6.23999999999957 | -0.013 | -0.006 |  |
| 6.23499999999957 | -0.013 | -0.006 |  |
| 6.22999999999957 | -0.013 | -0.006 |  |
| 6.22499999999957 | -0.013 | -0.006 |  |
| 6.21999999999957 | -0.013 | -0.006 |  |
| 6.21499999999957 | -0.013 | -0.006 |  |
| 6.20999999999957 | -0.013 | -0.006 |  |
| 6.20499999999957 | -0.013 | -0.006 |  |
| 6.19999999999957 | -0.013 | -0.006 |  |
| 6.19499999999957 | -0.013 | -0.006 |  |
| 6.18999999999957 | -0.013 | -0.006 |  |
| 6.184999999999571 | -0.013 | -0.006 |  |
| 6.17999999999957 | -0.013 | -0.006 |  |
| 6.174999999999571 | -0.013 | -0.006 |  |
| 6.169999999999571 | -0.013 | -0.006 |  |
| 6.164999999999571 | -0.013 | -0.006 |  |
| 6.159999999999571 | -0.013 | -0.006 |  |
| 6.154999999999571 | -0.013 | -0.006 |  |
| 6.149999999999571 | -0.013 | -0.006 |  |
| 6.144999999999571 | -0.013 | -0.006 |  |
| 6.139999999999571 | -0.013 | -0.006 |  |
| 6.134999999999572 | -0.013 | -0.006 |  |
| 6.129999999999572 | -0.013 | -0.006 |  |
| 6.124999999999572 | -0.013 | -0.006 |  |
| 6.119999999999572 | -0.013 | -0.006 |  |
| 6.114999999999572 | -0.013 | -0.006 |  |
| 6.109999999999572 | -0.013 | -0.006 |  |
| 6.104999999999572 | -0.013 | -0.006 |  |
| 6.099999999999572 | -0.013 | -0.006 |  |
| 6.094999999999573 | -0.013 | -0.006 |  |
| 6.089999999999572 | -0.013 | -0.006 |  |
| 6.084999999999573 | -0.014 | -0.006 |  |
| 6.079999999999572 | -0.014 | -0.006 |  |
| 6.074999999999573 | -0.014 | -0.006 |  |
| 6.069999999999573 | -0.014 | -0.006 |  |
| 6.064999999999573 | -0.014 | -0.006 |  |
| 6.059999999999573 | -0.014 | -0.006 |  |
| 6.054999999999573 | -0.014 | -0.006 |  |
| 6.049999999999573 | -0.014 | -0.006 |  |
| 6.044999999999574 | -0.014 | -0.006 |  |
| 6.039999999999573 | -0.014 | -0.006 |  |
| 6.034999999999574 | -0.014 | -0.006 |  |
| 6.029999999999574 | -0.014 | -0.006 |  |
| 6.024999999999574 | -0.014 | -0.006 |  |
| 6.019999999999574 | -0.014 | -0.006 |  |
| 6.014999999999574 | -0.014 | -0.006 |  |
| 6.009999999999574 | -0.014 | -0.006 |  |
| 6.004999999999574 | -0.014 | -0.006 |  |
| 5.999999999999574 | -0.014 | -0.006 |  |
| 5.994999999999574 | -0.014 | -0.006 |  |
| 5.989999999999574 | -0.014 | -0.006 |  |
| 5.984999999999574 | -0.014 | -0.006 |  |
| 5.979999999999574 | -0.014 | -0.006 |  |
| 5.974999999999575 | -0.014 | -0.006 |  |
| 5.969999999999575 | -0.014 | -0.006 |  |
| 5.964999999999575 | -0.014 | -0.006 |  |
| 5.959999999999575 | -0.014 | -0.006 |  |
| 5.954999999999575 | -0.014 | -0.006 |  |
| 5.949999999999575 | -0.014 | -0.006 |  |
| 5.944999999999575 | -0.014 | -0.006 |  |
| 5.939999999999575 | -0.014 | -0.006 |  |
| 5.934999999999575 | -0.014 | -0.006 |  |
| 5.929999999999576 | -0.014 | -0.006 |  |
| 5.924999999999576 | -0.014 | -0.006 |  |
| 5.919999999999576 | -0.014 | -0.006 |  |
| 5.914999999999576 | -0.014 | -0.006 |  |
| 5.909999999999576 | -0.014 | -0.006 |  |
| 5.904999999999576 | -0.014 | -0.006 |  |
| 5.899999999999576 | -0.014 | -0.006 |  |
| 5.894999999999577 | -0.014 | -0.006 |  |
| 5.889999999999576 | -0.014 | -0.006 |  |
| 5.884999999999577 | -0.014 | -0.006 |  |
| 5.879999999999577 | -0.014 | -0.006 |  |
| 5.874999999999577 | -0.014 | -0.006 |  |
| 5.869999999999577 | -0.015 | -0.006 |  |
| 5.864999999999577 | -0.015 | -0.006 |  |
| 5.859999999999577 | -0.015 | -0.006 |  |
| 5.854999999999578 | -0.015 | -0.006 |  |
| 5.849999999999577 | -0.015 | -0.006 |  |
| 5.844999999999578 | -0.015 | -0.006 |  |
| 5.839999999999577 | -0.015 | -0.006 |  |
| 5.834999999999578 | -0.015 | -0.006 |  |
| 5.829999999999578 | -0.015 | -0.006 |  |
| 5.824999999999578 | -0.015 | -0.006 |  |
| 5.819999999999578 | -0.015 | -0.006 |  |
| 5.814999999999578 | -0.015 | -0.006 |  |
| 5.809999999999578 | -0.015 | -0.006 |  |
| 5.804999999999579 | -0.015 | -0.006 |  |
| 5.799999999999578 | -0.015 | -0.006 |  |
| 5.794999999999579 | -0.015 | -0.006 |  |
| 5.789999999999578 | -0.015 | -0.006 |  |
| 5.78499999999958 | -0.015 | -0.006 |  |
| 5.77999999999958 | -0.015 | -0.006 |  |
| 5.77499999999958 | -0.015 | -0.006 |  |
| 5.76999999999958 | -0.015 | -0.006 |  |
| 5.764999999999579 | -0.015 | -0.006 |  |
| 5.75999999999958 | -0.015 | -0.006 |  |
| 5.75499999999958 | -0.015 | -0.006 |  |
| 5.74999999999958 | -0.015 | -0.006 |  |
| 5.74499999999958 | -0.015 | -0.006 |  |
| 5.73999999999958 | -0.015 | -0.006 |  |
| 5.73499999999958 | -0.015 | -0.006 |  |
| 5.72999999999958 | -0.015 | -0.006 |  |
| 5.72499999999958 | -0.015 | -0.006 |  |
| 5.71999999999958 | -0.015 | -0.006 |  |
| 5.714999999999581 | -0.015 | -0.006 |  |
| 5.70999999999958 | -0.015 | -0.006 |  |
| 5.704999999999581 | -0.015 | -0.006 |  |
| 5.699999999999581 | -0.015 | -0.006 |  |
| 5.694999999999581 | -0.015 | -0.006 |  |
| 5.689999999999581 | -0.015 | -0.006 |  |
| 5.684999999999581 | -0.015 | -0.006 |  |
| 5.679999999999581 | -0.015 | -0.006 |  |
| 5.674999999999581 | -0.016 | -0.006 |  |
| 5.669999999999581 | -0.016 | -0.006 |  |
| 5.664999999999582 | -0.016 | -0.006 |  |
| 5.659999999999582 | -0.016 | -0.006 |  |
| 5.654999999999582 | -0.016 | -0.006 |  |
| 5.649999999999582 | -0.016 | -0.006 |  |
| 5.644999999999582 | -0.016 | -0.006 |  |
| 5.639999999999582 | -0.016 | -0.006 |  |
| 5.634999999999582 | -0.016 | -0.006 |  |
| 5.629999999999582 | -0.016 | -0.006 |  |
| 5.624999999999582 | -0.016 | -0.006 |  |
| 5.619999999999583 | -0.016 | -0.006 |  |
| 5.614999999999583 | -0.016 | -0.006 |  |
| 5.609999999999583 | -0.016 | -0.006 |  |
| 5.604999999999583 | -0.016 | -0.006 |  |
| 5.599999999999583 | -0.016 | -0.006 |  |
| 5.594999999999583 | -0.016 | -0.006 |  |
| 5.589999999999583 | -0.016 | -0.006 |  |
| 5.584999999999583 | -0.016 | -0.006 |  |
| 5.579999999999583 | -0.016 | -0.006 |  |
| 5.574999999999584 | -0.016 | -0.006 |  |
| 5.569999999999584 | -0.016 | -0.006 |  |
| 5.564999999999584 | -0.016 | -0.006 |  |
| 5.559999999999584 | -0.016 | -0.006 |  |
| 5.554999999999584 | -0.016 | -0.006 |  |
| 5.549999999999584 | -0.016 | -0.006 |  |
| 5.544999999999584 | -0.016 | -0.006 |  |
| 5.539999999999584 | -0.016 | -0.006 |  |
| 5.534999999999584 | -0.016 | -0.006 |  |
| 5.529999999999584 | -0.016 | -0.006 |  |
| 5.524999999999585 | -0.016 | -0.006 |  |
| 5.519999999999584 | -0.016 | -0.006 |  |
| 5.514999999999585 | -0.016 | -0.006 |  |
| 5.509999999999585 | -0.016 | -0.006 |  |
| 5.504999999999585 | -0.016 | -0.006 |  |
| 5.499999999999585 | -0.017 | -0.006 |  |
| 5.494999999999585 | -0.017 | -0.006 |  |
| 5.489999999999585 | -0.017 | -0.006 |  |
| 5.484999999999585 | -0.017 | -0.006 |  |
| 5.479999999999585 | -0.017 | -0.006 |  |
| 5.474999999999585 | -0.017 | -0.006 |  |
| 5.469999999999585 | -0.017 | -0.006 |  |
| 5.464999999999586 | -0.017 | -0.006 |  |
| 5.459999999999586 | -0.017 | -0.006 |  |
| 5.454999999999586 | -0.017 | -0.006 |  |
| 5.449999999999586 | -0.017 | -0.006 |  |
| 5.444999999999586 | -0.017 | -0.006 |  |
| 5.439999999999586 | -0.017 | -0.006 |  |
| 5.434999999999586 | -0.017 | -0.006 |  |
| 5.429999999999586 | -0.017 | -0.006 |  |
| 5.424999999999587 | -0.017 | -0.006 |  |
| 5.419999999999586 | -0.017 | -0.006 |  |
| 5.414999999999587 | -0.017 | -0.006 |  |
| 5.409999999999587 | -0.017 | -0.006 |  |
| 5.404999999999587 | -0.017 | -0.006 |  |
| 5.399999999999587 | -0.017 | -0.006 |  |
| 5.394999999999587 | -0.017 | -0.006 |  |
| 5.389999999999587 | -0.017 | -0.006 |  |
| 5.384999999999588 | -0.017 | -0.006 |  |
| 5.379999999999587 | -0.017 | -0.006 |  |
| 5.374999999999588 | -0.017 | -0.006 |  |
| 5.369999999999588 | -0.017 | -0.006 |  |
| 5.364999999999588 | -0.017 | -0.006 |  |
| 5.359999999999588 | -0.017 | -0.006 |  |
| 5.354999999999588 | -0.017 | -0.006 |  |
| 5.349999999999588 | -0.017 | -0.006 |  |
| 5.344999999999588 | -0.018 | -0.006 |  |
| 5.339999999999588 | -0.018 | -0.006 |  |
| 5.334999999999589 | -0.018 | -0.006 |  |
| 5.329999999999589 | -0.018 | -0.006 |  |
| 5.324999999999589 | -0.018 | -0.006 |  |
| 5.31999999999959 | -0.018 | -0.006 |  |
| 5.314999999999589 | -0.018 | -0.006 |  |
| 5.30999999999959 | -0.018 | -0.006 |  |
| 5.304999999999589 | -0.018 | -0.006 |  |
| 5.29999999999959 | -0.018 | -0.006 |  |
| 5.29499999999959 | -0.018 | -0.006 |  |
| 5.28999999999959 | -0.018 | -0.006 |  |
| 5.28499999999959 | -0.018 | -0.006 |  |
| 5.27999999999959 | -0.018 | -0.006 |  |
| 5.27499999999959 | -0.018 | -0.006 |  |
| 5.26999999999959 | -0.018 | -0.006 |  |
| 5.26499999999959 | -0.018 | -0.006 |  |
| 5.25999999999959 | -0.018 | -0.006 |  |
| 5.25499999999959 | -0.018 | -0.006 |  |
| 5.24999999999959 | -0.018 | -0.006 |  |
| 5.244999999999591 | -0.018 | -0.006 |  |
| 5.23999999999959 | -0.018 | -0.006 |  |
| 5.234999999999591 | -0.018 | -0.006 |  |
| 5.229999999999591 | -0.018 | -0.006 |  |
| 5.224999999999591 | -0.018 | -0.006 |  |
| 5.219999999999591 | -0.018 | -0.006 |  |
| 5.214999999999591 | -0.018 | -0.006 |  |
| 5.209999999999591 | -0.018 | -0.006 |  |
| 5.204999999999591 | -0.018 | -0.006 |  |
| 5.199999999999592 | -0.018 | -0.006 |  |
| 5.194999999999592 | -0.019 | -0.006 |  |
| 5.189999999999592 | -0.019 | -0.006 |  |
| 5.184999999999592 | -0.019 | -0.006 |  |
| 5.179999999999592 | -0.019 | -0.006 |  |
| 5.174999999999592 | -0.019 | -0.006 |  |
| 5.169999999999592 | -0.019 | -0.006 |  |
| 5.164999999999592 | -0.019 | -0.006 |  |
| 5.159999999999592 | -0.019 | -0.006 |  |
| 5.154999999999593 | -0.019 | -0.006 |  |
| 5.149999999999593 | -0.019 | -0.006 |  |
| 5.144999999999593 | -0.019 | -0.006 |  |
| 5.139999999999593 | -0.019 | -0.006 |  |
| 5.134999999999593 | -0.019 | -0.006 |  |
| 5.129999999999593 | -0.019 | -0.006 |  |
| 5.124999999999593 | -0.019 | -0.006 |  |
| 5.119999999999593 | -0.019 | -0.006 |  |
| 5.114999999999593 | -0.019 | -0.006 |  |
| 5.109999999999594 | -0.019 | -0.006 |  |
| 5.104999999999594 | -0.019 | -0.006 |  |
| 5.099999999999594 | -0.019 | -0.006 |  |
| 5.094999999999594 | -0.019 | -0.006 |  |
| 5.089999999999594 | -0.019 | -0.006 |  |
| 5.084999999999594 | -0.019 | -0.006 |  |
| 5.079999999999594 | -0.019 | -0.006 |  |
| 5.074999999999594 | -0.019 | -0.006 |  |
| 5.069999999999594 | -0.019 | -0.006 |  |
| 5.064999999999594 | -0.019 | -0.006 |  |
| 5.059999999999594 | -0.02 | -0.006 |  |
| 5.054999999999595 | -0.02 | -0.006 |  |
| 5.049999999999594 | -0.02 | -0.006 |  |
| 5.044999999999595 | -0.02 | -0.006 |  |
| 5.039999999999595 | -0.02 | -0.006 |  |
| 5.034999999999595 | -0.02 | -0.006 |  |
| 5.029999999999595 | -0.02 | -0.006 |  |
| 5.024999999999595 | -0.02 | -0.006 |  |
| 5.019999999999595 | -0.02 | -0.006 |  |
| 5.014999999999596 | -0.02 | -0.006 |  |
| 5.009999999999595 | -0.02 | -0.006 |  |
| 5.004999999999596 | -0.02 | -0.006 |  |
| 4.999999999999595 | -0.02 | -0.006 |  |
| 4.994999999999596 | -0.02 | -0.006 |  |
| 4.989999999999596 | -0.02 | -0.006 |  |
| 4.984999999999596 | -0.02 | -0.006 |  |
| 4.979999999999596 | -0.02 | -0.006 |  |
| 4.974999999999596 | -0.02 | -0.006 |  |
| 4.969999999999596 | -0.02 | -0.006 |  |
| 4.964999999999597 | -0.02 | -0.006 |  |
| 4.959999999999596 | -0.02 | -0.006 |  |
| 4.954999999999597 | -0.02 | -0.006 |  |
| 4.949999999999596 | -0.02 | -0.006 |  |
| 4.944999999999597 | -0.02 | -0.006 |  |
| 4.939999999999597 | -0.02 | -0.006 |  |
| 4.934999999999597 | -0.021 | -0.006 |  |
| 4.929999999999597 | -0.021 | -0.006 |  |
| 4.924999999999597 | -0.021 | -0.006 |  |
| 4.919999999999597 | -0.021 | -0.006 |  |
| 4.914999999999598 | -0.021 | -0.006 |  |
| 4.909999999999597 | -0.021 | -0.006 |  |
| 4.904999999999598 | -0.021 | -0.006 |  |
| 4.899999999999598 | -0.021 | -0.006 |  |
| 4.894999999999598 | -0.021 | -0.006 |  |
| 4.889999999999598 | -0.021 | -0.006 |  |
| 4.884999999999598 | -0.021 | -0.006 |  |
| 4.879999999999598 | -0.021 | -0.006 |  |
| 4.874999999999598 | -0.021 | -0.006 |  |
| 4.869999999999599 | -0.021 | -0.006 |  |
| 4.864999999999599 | -0.021 | -0.006 |  |
| 4.859999999999599 | -0.021 | -0.006 |  |
| 4.854999999999599 | -0.021 | -0.006 |  |
| 4.8499999999996 | -0.021 | -0.006 |  |
| 4.844999999999599 | -0.021 | -0.006 |  |
| 4.8399999999996 | -0.021 | -0.006 |  |
| 4.834999999999599 | -0.021 | -0.006 |  |
| 4.829999999999599 | -0.021 | -0.006 |  |
| 4.8249999999996 | -0.021 | -0.006 |  |
| 4.8199999999996 | -0.022 | -0.006 |  |
| 4.8149999999996 | -0.022 | -0.006 |  |
| 4.8099999999996 | -0.022 | -0.006 |  |
| 4.8049999999996 | -0.022 | -0.006 |  |
| 4.7999999999996 | -0.022 | -0.006 |  |
| 4.7949999999996 | -0.022 | -0.006 |  |
| 4.7899999999996 | -0.022 | -0.006 |  |
| 4.7849999999996 | -0.022 | -0.006 |  |
| 4.7799999999996 | -0.022 | -0.006 |  |
| 4.7749999999996 | -0.022 | -0.006 |  |
| 4.7699999999996 | -0.022 | -0.006 |  |
| 4.764999999999601 | -0.022 | -0.006 |  |
| 4.7599999999996 | -0.022 | -0.006 |  |
| 4.754999999999601 | -0.022 | -0.006 |  |
| 4.7499999999996 | -0.022 | -0.006 |  |
| 4.744999999999601 | -0.022 | -0.006 |  |
| 4.7399999999996 | -0.022 | -0.006 |  |
| 4.734999999999601 | -0.022 | -0.006 |  |
| 4.729999999999601 | -0.022 | -0.006 |  |
| 4.724999999999602 | -0.022 | -0.006 |  |
| 4.719999999999601 | -0.022 | -0.006 |  |
| 4.714999999999602 | -0.022 | -0.006 |  |
| 4.709999999999601 | -0.023 | -0.006 |  |
| 4.704999999999602 | -0.023 | -0.006 |  |
| 4.699999999999602 | -0.023 | -0.006 |  |
| 4.694999999999602 | -0.023 | -0.006 |  |
| 4.689999999999602 | -0.023 | -0.006 |  |
| 4.684999999999602 | -0.023 | -0.006 |  |
| 4.679999999999602 | -0.023 | -0.006 |  |
| 4.674999999999603 | -0.023 | -0.006 |  |
| 4.669999999999603 | -0.023 | -0.006 |  |
| 4.664999999999603 | -0.023 | -0.006 |  |
| 4.659999999999603 | -0.023 | -0.006 |  |
| 4.654999999999603 | -0.023 | -0.006 |  |
| 4.649999999999603 | -0.023 | -0.006 |  |
| 4.644999999999603 | -0.023 | -0.006 |  |
| 4.639999999999603 | -0.023 | -0.006 |  |
| 4.634999999999604 | -0.023 | -0.006 |  |
| 4.629999999999604 | -0.023 | -0.006 |  |
| 4.624999999999604 | -0.023 | -0.006 |  |
| 4.619999999999604 | -0.023 | -0.006 |  |
| 4.614999999999604 | -0.023 | -0.006 |  |
| 4.609999999999604 | -0.024 | -0.006 |  |
| 4.604999999999604 | -0.024 | -0.006 |  |
| 4.599999999999604 | -0.024 | -0.006 |  |
| 4.594999999999604 | -0.024 | -0.006 |  |
| 4.589999999999604 | -0.024 | -0.006 |  |
| 4.584999999999604 | -0.024 | -0.006 |  |
| 4.579999999999604 | -0.024 | -0.006 |  |
| 4.574999999999604 | -0.024 | -0.006 |  |
| 4.569999999999605 | -0.024 | -0.006 |  |
| 4.564999999999605 | -0.024 | -0.006 |  |
| 4.559999999999605 | -0.024 | -0.006 |  |
| 4.554999999999605 | -0.024 | -0.006 |  |
| 4.549999999999605 | -0.024 | -0.006 |  |
| 4.544999999999605 | -0.024 | -0.006 |  |
| 4.539999999999605 | -0.024 | -0.006 |  |
| 4.534999999999605 | -0.024 | -0.006 |  |
| 4.529999999999605 | -0.024 | -0.006 |  |
| 4.524999999999606 | -0.024 | -0.006 |  |
| 4.519999999999606 | -0.024 | -0.006 |  |
| 4.514999999999606 | -0.025 | -0.006 |  |
| 4.509999999999606 | -0.025 | -0.006 |  |
| 4.504999999999606 | -0.025 | -0.006 |  |
| 4.499999999999606 | -0.025 | -0.006 |  |
| 4.494999999999606 | -0.025 | -0.006 |  |
| 4.489999999999606 | -0.025 | -0.006 |  |
| 4.484999999999606 | -0.025 | -0.006 |  |
| 4.479999999999606 | -0.025 | -0.006 |  |
| 4.474999999999607 | -0.025 | -0.006 |  |
| 4.469999999999607 | -0.025 | -0.006 |  |
| 4.464999999999607 | -0.025 | -0.006 |  |
| 4.459999999999607 | -0.025 | -0.006 |  |
| 4.454999999999607 | -0.025 | -0.006 |  |
| 4.449999999999607 | -0.025 | -0.006 |  |
| 4.444999999999607 | -0.025 | -0.006 |  |
| 4.439999999999607 | -0.025 | -0.006 |  |
| 4.434999999999607 | -0.025 | -0.006 |  |
| 4.429999999999607 | -0.025 | -0.006 |  |
| 4.424999999999608 | -0.026 | -0.006 |  |
| 4.419999999999608 | -0.026 | -0.006 |  |
| 4.414999999999608 | -0.026 | -0.006 |  |
| 4.409999999999608 | -0.026 | -0.006 |  |
| 4.404999999999608 | -0.026 | -0.006 |  |
| 4.399999999999608 | -0.026 | -0.006 |  |
| 4.394999999999609 | -0.026 | -0.006 |  |
| 4.389999999999608 | -0.026 | -0.006 |  |
| 4.384999999999609 | -0.026 | -0.006 |  |
| 4.37999999999961 | -0.026 | -0.006 |  |
| 4.37499999999961 | -0.026 | -0.006 |  |
| 4.36999999999961 | -0.026 | -0.006 |  |
| 4.364999999999609 | -0.026 | -0.006 |  |
| 4.35999999999961 | -0.026 | -0.006 |  |
| 4.35499999999961 | -0.026 | -0.006 |  |
| 4.34999999999961 | -0.026 | -0.006 |  |
| 4.34499999999961 | -0.026 | -0.006 |  |
| 4.33999999999961 | -0.027 | -0.006 |  |
| 4.33499999999961 | -0.027 | -0.006 |  |
| 4.32999999999961 | -0.027 | -0.006 |  |
| 4.32499999999961 | -0.027 | -0.006 |  |
| 4.31999999999961 | -0.027 | -0.006 |  |
| 4.31499999999961 | -0.027 | -0.006 |  |
| 4.30999999999961 | -0.027 | -0.006 |  |
| 4.304999999999611 | -0.027 | -0.006 |  |
| 4.29999999999961 | -0.027 | -0.006 |  |
| 4.294999999999611 | -0.027 | -0.006 |  |
| 4.28999999999961 | -0.027 | -0.006 |  |
| 4.284999999999611 | -0.027 | -0.006 |  |
| 4.27999999999961 | -0.027 | -0.006 |  |
| 4.274999999999611 | -0.027 | -0.006 |  |
| 4.269999999999611 | -0.027 | -0.006 |  |
| 4.264999999999612 | -0.027 | -0.006 |  |
| 4.259999999999611 | -0.028 | -0.006 |  |
| 4.254999999999612 | -0.028 | -0.006 |  |
| 4.249999999999611 | -0.028 | -0.006 |  |
| 4.244999999999612 | -0.028 | -0.006 |  |
| 4.239999999999612 | -0.028 | -0.006 |  |
| 4.234999999999612 | -0.028 | -0.006 |  |
| 4.229999999999612 | -0.028 | -0.006 |  |
| 4.224999999999612 | -0.028 | -0.006 |  |
| 4.219999999999612 | -0.028 | -0.006 |  |
| 4.214999999999613 | -0.028 | -0.006 |  |
| 4.209999999999612 | -0.028 | -0.006 |  |
| 4.204999999999613 | -0.028 | -0.006 |  |
| 4.199999999999613 | -0.028 | -0.006 |  |
| 4.194999999999613 | -0.028 | -0.006 |  |
| 4.189999999999613 | -0.028 | -0.006 |  |
| 4.184999999999613 | -0.029 | -0.006 |  |
| 4.179999999999613 | -0.029 | -0.006 |  |
| 4.174999999999613 | -0.029 | -0.006 |  |
| 4.169999999999614 | -0.029 | -0.006 |  |
| 4.164999999999614 | -0.029 | -0.006 |  |
| 4.159999999999614 | -0.029 | -0.006 |  |
| 4.154999999999614 | -0.029 | -0.006 |  |
| 4.149999999999614 | -0.029 | -0.006 |  |
| 4.144999999999614 | -0.029 | -0.006 |  |
| 4.139999999999614 | -0.029 | -0.006 |  |
| 4.134999999999614 | -0.029 | -0.006 |  |
| 4.129999999999614 | -0.029 | -0.006 |  |
| 4.124999999999615 | -0.029 | -0.006 |  |
| 4.119999999999614 | -0.029 | -0.006 |  |
| 4.114999999999615 | -0.03 | -0.006 |  |
| 4.109999999999614 | -0.03 | -0.006 |  |
| 4.104999999999615 | -0.03 | -0.006 |  |
| 4.099999999999615 | -0.03 | -0.006 |  |
| 4.094999999999615 | -0.03 | -0.006 |  |
| 4.089999999999615 | -0.03 | -0.006 |  |
| 4.084999999999615 | -0.03 | -0.006 |  |
| 4.079999999999615 | -0.03 | -0.006 |  |
| 4.074999999999615 | -0.03 | -0.006 |  |
| 4.069999999999615 | -0.03 | -0.006 |  |
| 4.064999999999616 | -0.03 | -0.006 |  |
| 4.059999999999615 | -0.03 | -0.006 |  |
| 4.054999999999616 | -0.03 | -0.006 |  |
| 4.049999999999616 | -0.03 | -0.006 |  |
| 4.044999999999616 | -0.031 | -0.006 |  |
| 4.039999999999616 | -0.031 | -0.006 |  |
| 4.034999999999616 | -0.031 | -0.006 |  |
| 4.029999999999616 | -0.031 | -0.006 |  |
| 4.024999999999617 | -0.031 | -0.006 |  |
| 4.019999999999616 | -0.031 | -0.006 |  |
| 4.014999999999617 | -0.031 | -0.006 |  |
| 4.009999999999616 | -0.031 | -0.006 |  |
| 4.004999999999617 | -0.031 | -0.006 |  |
| 3.999999999999617 | -0.031 | -0.006 |  |
| 3.994999999999617 | -0.031 | -0.006 |  |
| 3.989999999999617 | -0.031 | -0.006 |  |
| 3.984999999999617 | -0.031 | -0.006 |  |
| 3.979999999999618 | -0.032 | -0.006 |  |
| 3.974999999999618 | -0.032 | -0.006 |  |
| 3.969999999999618 | -0.032 | -0.006 |  |
| 3.964999999999618 | -0.032 | -0.006 |  |
| 3.959999999999618 | -0.032 | -0.006 |  |
| 3.954999999999618 | -0.032 | -0.006 |  |
| 3.949999999999618 | -0.032 | -0.006 |  |
| 3.944999999999618 | -0.032 | -0.006 |  |
| 3.939999999999618 | -0.032 | -0.006 |  |
| 3.934999999999619 | -0.032 | -0.006 |  |
| 3.929999999999619 | -0.032 | -0.006 |  |
| 3.924999999999619 | -0.032 | -0.006 |  |
| 3.919999999999619 | -0.033 | -0.006 |  |
| 3.914999999999619 | -0.033 | -0.006 |  |
| 3.909999999999619 | -0.033 | -0.006 |  |
| 3.904999999999619 | -0.033 | -0.006 |  |
| 3.899999999999619 | -0.033 | -0.006 |  |
| 3.894999999999619 | -0.033 | -0.006 |  |
| 3.889999999999619 | -0.033 | -0.006 |  |
| 3.88499999999962 | -0.033 | -0.006 |  |
| 3.87999999999962 | -0.033 | -0.006 |  |
| 3.87499999999962 | -0.033 | -0.006 |  |
| 3.86999999999962 | -0.033 | -0.006 |  |
| 3.86499999999962 | -0.033 | -0.006 |  |
| 3.85999999999962 | -0.034 | -0.006 |  |
| 3.85499999999962 | -0.034 | -0.006 |  |
| 3.84999999999962 | -0.034 | -0.006 |  |
| 3.84499999999962 | -0.034 | -0.005 |  |
| 3.839999999999621 | -0.034 | -0.005 |  |
| 3.834999999999621 | -0.034 | -0.005 |  |
| 3.829999999999621 | -0.034 | -0.005 |  |
| 3.824999999999621 | -0.034 | -0.005 |  |
| 3.819999999999621 | -0.034 | -0.005 |  |
| 3.814999999999621 | -0.034 | -0.005 |  |
| 3.809999999999621 | -0.034 | -0.005 |  |
| 3.804999999999621 | -0.035 | -0.005 |  |
| 3.799999999999621 | -0.035 | -0.005 |  |
| 3.794999999999621 | -0.035 | -0.005 |  |
| 3.789999999999622 | -0.035 | -0.005 |  |
| 3.784999999999622 | -0.035 | -0.005 |  |
| 3.779999999999622 | -0.035 | -0.005 |  |
| 3.774999999999622 | -0.035 | -0.005 |  |
| 3.769999999999622 | -0.035 | -0.005 |  |
| 3.764999999999622 | -0.035 | -0.005 |  |
| 3.759999999999622 | -0.035 | -0.005 |  |
| 3.754999999999622 | -0.035 | -0.005 |  |
| 3.749999999999622 | -0.036 | -0.005 |  |
| 3.744999999999623 | -0.036 | -0.005 |  |
| 3.739999999999623 | -0.036 | -0.005 |  |
| 3.734999999999623 | -0.036 | -0.005 |  |
| 3.729999999999623 | -0.036 | -0.005 |  |
| 3.724999999999623 | -0.036 | -0.005 |  |
| 3.719999999999623 | -0.036 | -0.005 |  |
| 3.714999999999623 | -0.036 | -0.005 |  |
| 3.709999999999623 | -0.036 | -0.005 |  |
| 3.704999999999623 | -0.036 | -0.005 |  |
| 3.699999999999623 | -0.037 | -0.005 |  |
| 3.694999999999624 | -0.037 | -0.005 |  |
| 3.689999999999624 | -0.037 | -0.005 |  |
| 3.684999999999624 | -0.037 | -0.005 |  |
| 3.679999999999624 | -0.037 | -0.005 |  |
| 3.674999999999624 | -0.037 | -0.005 |  |
| 3.669999999999624 | -0.037 | -0.005 |  |
| 3.664999999999624 | -0.037 | -0.005 |  |
| 3.659999999999624 | -0.037 | -0.005 |  |
| 3.654999999999624 | -0.037 | -0.005 |  |
| 3.649999999999625 | -0.038 | -0.005 |  |
| 3.644999999999625 | -0.038 | -0.005 |  |
| 3.639999999999625 | -0.038 | -0.005 |  |
| 3.634999999999625 | -0.038 | -0.005 |  |
| 3.629999999999625 | -0.038 | -0.005 |  |
| 3.624999999999625 | -0.038 | -0.005 |  |
| 3.619999999999625 | -0.038 | -0.005 |  |
| 3.614999999999625 | -0.038 | -0.005 |  |
| 3.609999999999625 | -0.038 | -0.005 |  |
| 3.604999999999626 | -0.038 | -0.005 |  |
| 3.599999999999626 | -0.039 | -0.005 |  |
| 3.594999999999626 | -0.039 | -0.005 |  |
| 3.589999999999626 | -0.039 | -0.005 |  |
| 3.584999999999626 | -0.039 | -0.005 |  |
| 3.579999999999626 | -0.039 | -0.005 |  |
| 3.574999999999626 | -0.039 | -0.005 |  |
| 3.569999999999626 | -0.039 | -0.005 |  |
| 3.564999999999626 | -0.039 | -0.004 |  |
| 3.559999999999627 | -0.039 | -0.004 |  |
| 3.554999999999627 | -0.04 | -0.004 |  |
| 3.549999999999627 | -0.04 | -0.004 |  |
| 3.544999999999627 | -0.04 | -0.004 |  |
| 3.539999999999627 | -0.04 | -0.004 |  |
| 3.534999999999627 | -0.04 | -0.004 |  |
| 3.529999999999627 | -0.04 | -0.004 |  |
| 3.524999999999627 | -0.04 | -0.004 |  |
| 3.519999999999627 | -0.04 | -0.004 |  |
| 3.514999999999628 | -0.04 | -0.004 |  |
| 3.509999999999628 | -0.041 | -0.004 |  |
| 3.504999999999628 | -0.041 | -0.004 |  |
| 3.499999999999628 | -0.041 | -0.004 |  |
| 3.494999999999628 | -0.041 | -0.004 |  |
| 3.489999999999628 | -0.041 | -0.004 |  |
| 3.484999999999628 | -0.041 | -0.004 |  |
| 3.479999999999628 | -0.041 | -0.004 |  |
| 3.474999999999628 | -0.041 | -0.004 |  |
| 3.469999999999628 | -0.042 | -0.004 |  |
| 3.464999999999629 | -0.042 | -0.004 |  |
| 3.459999999999629 | -0.042 | -0.004 |  |
| 3.454999999999629 | -0.042 | -0.004 |  |
| 3.449999999999629 | -0.042 | -0.004 |  |
| 3.444999999999629 | -0.042 | -0.004 |  |
| 3.439999999999629 | -0.042 | -0.004 |  |
| 3.434999999999629 | -0.042 | -0.004 |  |
| 3.429999999999629 | -0.042 | -0.004 |  |
| 3.424999999999629 | -0.043 | -0.004 |  |
| 3.41999999999963 | -0.043 | -0.004 |  |
| 3.41499999999963 | -0.043 | -0.004 |  |
| 3.40999999999963 | -0.043 | -0.004 |  |
| 3.40499999999963 | -0.043 | -0.004 |  |
| 3.39999999999963 | -0.043 | -0.004 |  |
| 3.39499999999963 | -0.043 | -0.004 |  |
| 3.38999999999963 | -0.044 | -0.004 |  |
| 3.38499999999963 | -0.044 | -0.003 |  |
| 3.37999999999963 | -0.044 | -0.003 |  |
| 3.37499999999963 | -0.044 | -0.003 |  |
| 3.369999999999631 | -0.044 | -0.003 |  |
| 3.364999999999631 | -0.044 | -0.003 |  |
| 3.359999999999631 | -0.044 | -0.003 |  |
| 3.354999999999631 | -0.044 | -0.003 |  |
| 3.349999999999631 | -0.045 | -0.003 |  |
| 3.344999999999631 | -0.045 | -0.003 |  |
| 3.339999999999631 | -0.045 | -0.003 |  |
| 3.334999999999631 | -0.045 | -0.003 |  |
| 3.329999999999631 | -0.045 | -0.003 |  |
| 3.324999999999632 | -0.045 | -0.003 |  |
| 3.319999999999632 | -0.045 | -0.003 |  |
| 3.314999999999632 | -0.045 | -0.003 |  |
| 3.309999999999632 | -0.046 | -0.003 |  |
| 3.304999999999632 | -0.046 | -0.003 |  |
| 3.299999999999632 | -0.046 | -0.003 |  |
| 3.294999999999632 | -0.046 | -0.003 |  |
| 3.289999999999632 | -0.046 | -0.003 |  |
| 3.284999999999632 | -0.046 | -0.003 |  |
| 3.279999999999633 | -0.046 | -0.003 |  |
| 3.274999999999633 | -0.047 | -0.003 |  |
| 3.269999999999633 | -0.047 | -0.003 |  |
| 3.264999999999633 | -0.047 | -0.003 |  |
| 3.259999999999633 | -0.047 | -0.003 |  |
| 3.254999999999633 | -0.047 | -0.003 |  |
| 3.249999999999633 | -0.047 | -0.003 |  |
| 3.244999999999633 | -0.047 | -0.002 |  |
| 3.239999999999633 | -0.048 | -0.002 |  |
| 3.234999999999633 | -0.048 | -0.002 |  |
| 3.229999999999634 | -0.048 | -0.002 |  |
| 3.224999999999634 | -0.048 | -0.002 |  |
| 3.219999999999634 | -0.048 | -0.002 |  |
| 3.214999999999634 | -0.048 | -0.002 |  |
| 3.209999999999634 | -0.049 | -0.002 |  |
| 3.204999999999634 | -0.049 | -0.002 |  |
| 3.199999999999634 | -0.049 | -0.002 |  |
| 3.194999999999634 | -0.049 | -0.002 |  |
| 3.189999999999634 | -0.049 | -0.002 |  |
| 3.184999999999635 | -0.049 | -0.002 |  |
| 3.179999999999635 | -0.049 | -0.002 |  |
| 3.174999999999635 | -0.05 | -0.002 |  |
| 3.169999999999635 | -0.05 | -0.002 |  |
| 3.164999999999635 | -0.05 | -0.002 |  |
| 3.159999999999635 | -0.05 | -0.002 |  |
| 3.154999999999635 | -0.05 | -0.002 |  |
| 3.149999999999635 | -0.05 | -0.002 |  |
| 3.144999999999635 | -0.051 | -0.002 |  |
| 3.139999999999636 | -0.051 | -0.002 |  |
| 3.134999999999636 | -0.051 | -0.001 |  |
| 3.129999999999636 | -0.051 | -0.001 |  |
| 3.124999999999636 | -0.051 | -0.001 |  |
| 3.119999999999636 | -0.051 | -0.001 |  |
| 3.114999999999636 | -0.052 | -0.001 |  |
| 3.109999999999636 | -0.052 | -0.001 |  |
| 3.104999999999636 | -0.052 | -0.001 |  |
| 3.099999999999636 | -0.052 | -0.001 |  |
| 3.094999999999636 | -0.052 | -0.001 |  |
| 3.089999999999637 | -0.052 | -0.001 |  |
| 3.084999999999637 | -0.053 | -0.001 |  |
| 3.079999999999637 | -0.053 | -0.001 |  |
| 3.074999999999637 | -0.053 | -0.001 |  |
| 3.069999999999637 | -0.053 | -0.001 |  |
| 3.064999999999637 | -0.053 | -0.001 |  |
| 3.059999999999637 | -0.053 | -0.001 |  |
| 3.054999999999637 | -0.054 | -0.001 |  |
| 3.049999999999637 | -0.054 | -0.001 |  |
| 3.044999999999638 | -0.054 | -0.001 |  |
| 3.039999999999638 | -0.054 | 0 |  |
| 3.034999999999638 | -0.054 | 0 |  |
| 3.029999999999638 | -0.054 | 0 |  |
| 3.024999999999638 | -0.055 | 0 |  |
| 3.019999999999638 | -0.055 | 0 |  |
| 3.014999999999638 | -0.055 | 0 |  |
| 3.009999999999638 | -0.055 | 0 |  |
| 3.004999999999638 | -0.055 | 0 |  |
| 2.999999999999638 | -0.056 | 0 |  |
| 2.994999999999639 | -0.056 | 0 |  |
| 2.989999999999639 | -0.056 | 0 |  |
| 2.984999999999639 | -0.056 | 0 |  |
| 2.979999999999639 | -0.056 | 0 |  |
| 2.974999999999639 | -0.056 | 0 |  |
| 2.969999999999639 | -0.057 | 0 |  |
| 2.964999999999639 | -0.057 | 0 |  |
| 2.959999999999639 | -0.057 | 0.001 |  |
| 2.954999999999639 | -0.057 | 0.001 |  |
| 2.94999999999964 | -0.057 | 0.001 |  |
| 2.94499999999964 | -0.058 | 0.001 |  |
| 2.93999999999964 | -0.058 | 0.001 |  |
| 2.93499999999964 | -0.058 | 0.001 |  |
| 2.92999999999964 | -0.058 | 0.001 |  |
| 2.92499999999964 | -0.058 | 0.001 |  |
| 2.91999999999964 | -0.059 | 0.001 |  |
| 2.91499999999964 | -0.059 | 0.001 |  |
| 2.90999999999964 | -0.059 | 0.001 |  |
| 2.904999999999641 | -0.059 | 0.001 |  |
| 2.899999999999641 | -0.059 | 0.001 |  |
| 2.894999999999641 | -0.06 | 0.001 |  |
| 2.889999999999641 | -0.06 | 0.001 |  |
| 2.884999999999641 | -0.06 | 0.002 |  |
| 2.879999999999641 | -0.06 | 0.002 |  |
| 2.874999999999641 | -0.06 | 0.002 |  |
| 2.869999999999641 | -0.061 | 0.002 |  |
| 2.864999999999641 | -0.061 | 0.002 |  |
| 2.859999999999641 | -0.061 | 0.002 |  |
| 2.854999999999642 | -0.061 | 0.002 |  |
| 2.849999999999642 | -0.062 | 0.002 |  |
| 2.844999999999642 | -0.062 | 0.002 |  |
| 2.839999999999642 | -0.062 | 0.002 |  |
| 2.834999999999642 | -0.062 | 0.002 |  |
| 2.829999999999642 | -0.062 | 0.002 |  |
| 2.824999999999642 | -0.063 | 0.003 |  |
| 2.819999999999642 | -0.063 | 0.003 |  |
| 2.814999999999642 | -0.063 | 0.003 |  |
| 2.809999999999643 | -0.063 | 0.003 |  |
| 2.804999999999643 | -0.064 | 0.003 |  |
| 2.799999999999643 | -0.064 | 0.003 |  |
| 2.794999999999643 | -0.064 | 0.003 |  |
| 2.789999999999643 | -0.064 | 0.003 |  |
| 2.784999999999643 | -0.064 | 0.003 |  |
| 2.779999999999643 | -0.065 | 0.003 |  |
| 2.774999999999643 | -0.065 | 0.003 |  |
| 2.769999999999643 | -0.065 | 0.003 |  |
| 2.764999999999643 | -0.065 | 0.004 |  |
| 2.759999999999644 | -0.066 | 0.004 |  |
| 2.754999999999644 | -0.066 | 0.004 |  |
| 2.749999999999644 | -0.066 | 0.004 |  |
| 2.744999999999644 | -0.066 | 0.004 |  |
| 2.739999999999644 | -0.067 | 0.004 |  |
| 2.734999999999644 | -0.067 | 0.004 |  |
| 2.729999999999644 | -0.067 | 0.004 |  |
| 2.724999999999644 | -0.067 | 0.004 |  |
| 2.719999999999644 | -0.068 | 0.004 |  |
| 2.714999999999645 | -0.068 | 0.004 |  |
| 2.709999999999645 | -0.068 | 0.005 |  |
| 2.704999999999645 | -0.068 | 0.005 |  |
| 2.699999999999645 | -0.069 | 0.005 |  |
| 2.694999999999645 | -0.069 | 0.005 |  |
| 2.689999999999645 | -0.069 | 0.005 |  |
| 2.684999999999645 | -0.069 | 0.005 |  |
| 2.679999999999645 | -0.07 | 0.005 |  |
| 2.674999999999645 | -0.07 | 0.005 |  |
| 2.669999999999645 | -0.07 | 0.005 |  |
| 2.664999999999646 | -0.07 | 0.006 |  |
| 2.659999999999646 | -0.071 | 0.006 |  |
| 2.654999999999646 | -0.071 | 0.006 |  |
| 2.649999999999646 | -0.071 | 0.006 |  |
| 2.644999999999646 | -0.071 | 0.006 |  |
| 2.639999999999646 | -0.072 | 0.006 |  |
| 2.634999999999646 | -0.072 | 0.006 |  |
| 2.629999999999646 | -0.072 | 0.006 |  |
| 2.624999999999646 | -0.073 | 0.006 |  |
| 2.619999999999647 | -0.073 | 0.007 |  |
| 2.614999999999647 | -0.073 | 0.007 |  |
| 2.609999999999647 | -0.073 | 0.007 |  |
| 2.604999999999647 | -0.074 | 0.007 |  |
| 2.599999999999647 | -0.074 | 0.007 |  |
| 2.594999999999647 | -0.074 | 0.007 |  |
| 2.589999999999647 | -0.075 | 0.007 |  |
| 2.584999999999647 | -0.075 | 0.007 |  |
| 2.579999999999647 | -0.075 | 0.007 |  |
| 2.574999999999648 | -0.075 | 0.008 |  |
| 2.569999999999648 | -0.076 | 0.008 |  |
| 2.564999999999648 | -0.076 | 0.008 |  |
| 2.559999999999648 | -0.076 | 0.008 |  |
| 2.554999999999648 | -0.077 | 0.008 |  |
| 2.549999999999648 | -0.077 | 0.008 |  |
| 2.544999999999648 | -0.077 | 0.008 |  |
| 2.539999999999648 | -0.078 | 0.009 |  |
| 2.534999999999648 | -0.078 | 0.009 |  |
| 2.529999999999649 | -0.078 | 0.009 |  |
| 2.524999999999649 | -0.078 | 0.009 |  |
| 2.519999999999649 | -0.079 | 0.009 |  |
| 2.514999999999649 | -0.079 | 0.009 |  |
| 2.509999999999649 | -0.079 | 0.009 |  |
| 2.504999999999649 | -0.08 | 0.009 |  |
| 2.499999999999649 | -0.08 | 0.01 |  |
| 2.494999999999649 | -0.08 | 0.01 |  |
| 2.489999999999649 | -0.081 | 0.01 |  |
| 2.484999999999649 | -0.081 | 0.01 |  |
| 2.47999999999965 | -0.081 | 0.01 |  |
| 2.47499999999965 | -0.082 | 0.01 |  |
| 2.46999999999965 | -0.082 | 0.01 |  |
| 2.46499999999965 | -0.082 | 0.011 |  |
| 2.45999999999965 | -0.083 | 0.011 |  |
| 2.45499999999965 | -0.083 | 0.011 |  |
| 2.44999999999965 | -0.083 | 0.011 |  |
| 2.44499999999965 | -0.084 | 0.011 |  |
| 2.43999999999965 | -0.084 | 0.011 |  |
| 2.434999999999651 | -0.084 | 0.012 |  |
| 2.429999999999651 | -0.085 | 0.012 |  |
| 2.424999999999651 | -0.085 | 0.012 |  |
| 2.419999999999651 | -0.085 | 0.012 |  |
| 2.414999999999651 | -0.086 | 0.012 |  |
| 2.409999999999651 | -0.086 | 0.012 |  |
| 2.404999999999651 | -0.086 | 0.012 |  |
| 2.399999999999651 | -0.087 | 0.013 |  |
| 2.394999999999651 | -0.087 | 0.013 |  |
| 2.389999999999651 | -0.088 | 0.013 |  |
| 2.384999999999652 | -0.088 | 0.013 |  |
| 2.379999999999652 | -0.088 | 0.013 |  |
| 2.374999999999652 | -0.089 | 0.014 |  |
| 2.369999999999652 | -0.089 | 0.014 |  |
| 2.364999999999652 | -0.089 | 0.014 |  |
| 2.359999999999652 | -0.09 | 0.014 |  |
| 2.354999999999652 | -0.09 | 0.014 |  |
| 2.349999999999652 | -0.091 | 0.014 |  |
| 2.344999999999652 | -0.091 | 0.015 |  |
| 2.339999999999653 | -0.091 | 0.015 |  |
| 2.334999999999653 | -0.092 | 0.015 |  |
| 2.329999999999653 | -0.092 | 0.015 |  |
| 2.324999999999653 | -0.092 | 0.015 |  |
| 2.319999999999653 | -0.093 | 0.015 |  |
| 2.314999999999653 | -0.093 | 0.016 |  |
| 2.309999999999653 | -0.094 | 0.016 |  |
| 2.304999999999653 | -0.094 | 0.016 |  |
| 2.299999999999653 | -0.095 | 0.016 |  |
| 2.294999999999654 | -0.095 | 0.016 |  |
| 2.289999999999654 | -0.095 | 0.017 |  |
| 2.284999999999654 | -0.096 | 0.017 |  |
| 2.279999999999654 | -0.096 | 0.017 |  |
| 2.274999999999654 | -0.097 | 0.017 |  |
| 2.269999999999654 | -0.097 | 0.017 |  |
| 2.264999999999654 | -0.097 | 0.018 |  |
| 2.259999999999654 | -0.098 | 0.018 |  |
| 2.254999999999654 | -0.098 | 0.018 |  |
| 2.249999999999654 | -0.099 | 0.018 |  |
| 2.244999999999655 | -0.099 | 0.019 |  |
| 2.239999999999655 | -0.1 | 0.019 |  |
| 2.234999999999655 | -0.1 | 0.019 |  |
| 2.229999999999655 | -0.101 | 0.019 |  |
| 2.224999999999655 | -0.101 | 0.019 |  |
| 2.219999999999655 | -0.101 | 0.02 |  |
| 2.214999999999655 | -0.102 | 0.02 |  |
| 2.209999999999655 | -0.102 | 0.02 |  |
| 2.204999999999655 | -0.103 | 0.02 |  |
| 2.199999999999656 | -0.103 | 0.02 |  |
| 2.194999999999656 | -0.104 | 0.021 |  |
| 2.189999999999656 | -0.104 | 0.021 |  |
| 2.184999999999656 | -0.105 | 0.021 |  |
| 2.179999999999656 | -0.105 | 0.021 |  |
| 2.174999999999656 | -0.106 | 0.022 |  |
| 2.169999999999656 | -0.106 | 0.022 |  |
| 2.164999999999656 | -0.107 | 0.022 |  |
| 2.159999999999656 | -0.107 | 0.022 |  |
| 2.154999999999657 | -0.108 | 0.023 |  |
| 2.149999999999657 | -0.108 | 0.023 |  |
| 2.144999999999657 | -0.109 | 0.023 |  |
| 2.139999999999657 | -0.109 | 0.023 |  |
| 2.134999999999657 | -0.11 | 0.024 |  |
| 2.129999999999657 | -0.11 | 0.024 |  |
| 2.124999999999657 | -0.111 | 0.024 |  |
| 2.119999999999657 | -0.111 | 0.024 |  |
| 2.114999999999657 | -0.112 | 0.025 |  |
| 2.109999999999657 | -0.112 | 0.025 |  |
| 2.104999999999658 | -0.113 | 0.025 |  |
| 2.099999999999658 | -0.113 | 0.025 |  |
| 2.094999999999658 | -0.114 | 0.026 |  |
| 2.089999999999658 | -0.114 | 0.026 |  |
| 2.084999999999658 | -0.115 | 0.026 |  |
| 2.079999999999658 | -0.116 | 0.027 |  |
| 2.074999999999658 | -0.116 | 0.027 |  |
| 2.069999999999658 | -0.117 | 0.027 |  |
| 2.064999999999658 | -0.117 | 0.027 |  |
| 2.059999999999659 | -0.118 | 0.028 |  |
| 2.054999999999659 | -0.118 | 0.028 |  |
| 2.049999999999659 | -0.119 | 0.028 |  |
| 2.044999999999659 | -0.12 | 0.029 |  |
| 2.039999999999659 | -0.12 | 0.029 |  |
| 2.034999999999659 | -0.121 | 0.029 |  |
| 2.029999999999659 | -0.121 | 0.029 |  |
| 2.024999999999659 | -0.122 | 0.03 |  |
| 2.019999999999659 | -0.123 | 0.03 |  |
| 2.01499999999966 | -0.123 | 0.03 |  |
| 2.00999999999966 | -0.124 | 0.031 |  |
| 2.00499999999966 | -0.124 | 0.031 |  |
| 1.99999999999966 | -0.125 | 0.031 |  |
| 1.99499999999966 | -0.126 | 0.032 |  |
| 1.98999999999966 | -0.126 | 0.032 |  |
| 1.98499999999966 | -0.127 | 0.032 |  |
| 1.97999999999966 | -0.128 | 0.033 |  |
| 1.97499999999966 | -0.128 | 0.033 |  |
| 1.96999999999966 | -0.129 | 0.033 |  |
| 1.964999999999661 | -0.129 | 0.033 |  |
| 1.959999999999661 | -0.13 | 0.034 |  |
| 1.954999999999661 | -0.131 | 0.034 |  |
| 1.949999999999661 | -0.131 | 0.034 |  |
| 1.944999999999661 | -0.132 | 0.035 |  |
| 1.939999999999661 | -0.133 | 0.035 |  |
| 1.934999999999661 | -0.134 | 0.036 |  |
| 1.929999999999661 | -0.134 | 0.036 |  |
| 1.924999999999661 | -0.135 | 0.036 |  |
| 1.919999999999662 | -0.136 | 0.037 |  |
| 1.914999999999662 | -0.136 | 0.037 |  |
| 1.909999999999662 | -0.137 | 0.037 |  |
| 1.904999999999662 | -0.138 | 0.038 |  |
| 1.899999999999662 | -0.139 | 0.038 |  |
| 1.894999999999662 | -0.139 | 0.038 |  |
| 1.889999999999662 | -0.14 | 0.039 |  |
| 1.884999999999662 | -0.141 | 0.039 |  |
| 1.879999999999662 | -0.141 | 0.039 |  |
| 1.874999999999662 | -0.142 | 0.04 |  |
| 1.869999999999663 | -0.143 | 0.04 |  |
| 1.864999999999663 | -0.144 | 0.041 |  |
| 1.859999999999663 | -0.145 | 0.041 |  |
| 1.854999999999663 | -0.145 | 0.041 |  |
| 1.849999999999663 | -0.146 | 0.042 |  |
| 1.844999999999663 | -0.147 | 0.042 |  |
| 1.839999999999663 | -0.148 | 0.043 |  |
| 1.834999999999663 | -0.148 | 0.043 |  |
| 1.829999999999663 | -0.149 | 0.043 |  |
| 1.824999999999664 | -0.15 | 0.044 |  |
| 1.819999999999664 | -0.151 | 0.044 |  |
| 1.814999999999664 | -0.152 | 0.044 |  |
| 1.809999999999664 | -0.153 | 0.045 |  |
| 1.804999999999664 | -0.153 | 0.045 |  |
| 1.799999999999664 | -0.154 | 0.046 |  |
| 1.794999999999664 | -0.155 | 0.046 |  |
| 1.789999999999664 | -0.156 | 0.047 |  |
| 1.784999999999664 | -0.157 | 0.047 |  |
| 1.779999999999664 | -0.158 | 0.047 |  |
| 1.774999999999665 | -0.159 | 0.048 |  |
| 1.769999999999665 | -0.16 | 0.048 |  |
| 1.764999999999665 | -0.161 | 0.049 |  |
| 1.759999999999665 | -0.161 | 0.049 |  |
| 1.754999999999665 | -0.162 | 0.05 |  |
| 1.749999999999665 | -0.163 | 0.05 |  |
| 1.744999999999665 | -0.164 | 0.05 |  |
| 1.739999999999665 | -0.165 | 0.051 |  |
| 1.734999999999665 | -0.166 | 0.051 |  |
| 1.729999999999666 | -0.167 | 0.052 |  |
| 1.724999999999666 | -0.168 | 0.052 |  |
| 1.719999999999666 | -0.169 | 0.053 |  |
| 1.714999999999666 | -0.17 | 0.053 |  |
| 1.709999999999666 | -0.171 | 0.054 |  |
| 1.704999999999666 | -0.172 | 0.054 |  |
| 1.699999999999666 | -0.173 | 0.054 |  |
| 1.694999999999666 | -0.174 | 0.055 |  |
| 1.689999999999666 | -0.175 | 0.055 |  |
| 1.684999999999666 | -0.176 | 0.056 |  |
| 1.679999999999667 | -0.177 | 0.056 |  |
| 1.674999999999667 | -0.178 | 0.057 |  |
| 1.669999999999667 | -0.179 | 0.057 |  |
| 1.664999999999667 | -0.18 | 0.058 |  |
| 1.659999999999667 | -0.181 | 0.058 |  |
| 1.654999999999667 | -0.183 | 0.059 |  |
| 1.649999999999667 | -0.184 | 0.059 |  |
| 1.644999999999667 | -0.185 | 0.06 |  |
| 1.639999999999667 | -0.186 | 0.06 |  |
| 1.634999999999668 | -0.187 | 0.061 |  |
| 1.629999999999668 | -0.188 | 0.061 |  |
| 1.624999999999668 | -0.189 | 0.062 |  |
| 1.619999999999668 | -0.191 | 0.062 |  |
| 1.614999999999668 | -0.192 | 0.063 |  |
| 1.609999999999668 | -0.193 | 0.063 |  |
| 1.604999999999668 | -0.194 | 0.064 |  |
| 1.599999999999668 | -0.195 | 0.064 |  |
| 1.594999999999668 | -0.197 | 0.065 |  |
| 1.589999999999669 | -0.198 | 0.065 |  |
| 1.584999999999669 | -0.199 | 0.066 |  |
| 1.579999999999669 | -0.2 | 0.066 |  |
| 1.574999999999669 | -0.202 | 0.067 |  |
| 1.569999999999669 | -0.203 | 0.067 |  |
| 1.564999999999669 | -0.204 | 0.068 |  |
| 1.559999999999669 | -0.205 | 0.068 |  |
| 1.554999999999669 | -0.207 | 0.069 |  |
| 1.549999999999669 | -0.208 | 0.069 |  |
| 1.54499999999967 | -0.209 | 0.07 |  |
| 1.53999999999967 | -0.211 | 0.07 |  |
| 1.53499999999967 | -0.212 | 0.071 |  |
| 1.52999999999967 | -0.214 | 0.071 |  |
| 1.52499999999967 | -0.215 | 0.072 |  |
| 1.51999999999967 | -0.216 | 0.072 |  |
| 1.51499999999967 | -0.218 | 0.073 |  |
| 1.50999999999967 | -0.219 | 0.073 |  |
| 1.50499999999967 | -0.221 | 0.074 |  |
| 1.49999999999967 | -0.222 | 0.074 |  |
| 1.494999999999671 | -0.224 | 0.075 |  |
| 1.489999999999671 | -0.225 | 0.075 |  |
| 1.484999999999671 | -0.227 | 0.076 |  |
| 1.479999999999671 | -0.228 | 0.076 |  |
| 1.474999999999671 | -0.23 | 0.077 |  |
| 1.469999999999671 | -0.231 | 0.077 |  |
| 1.464999999999671 | -0.233 | 0.077 |  |
| 1.459999999999671 | -0.235 | 0.078 |  |
| 1.454999999999671 | -0.236 | 0.078 |  |
| 1.449999999999672 | -0.238 | 0.079 |  |
| 1.444999999999672 | -0.239 | 0.079 |  |
| 1.439999999999672 | -0.241 | 0.08 |  |
| 1.434999999999672 | -0.243 | 0.08 |  |
| 1.429999999999672 | -0.245 | 0.081 |  |
| 1.424999999999672 | -0.246 | 0.081 |  |
| 1.419999999999672 | -0.248 | 0.082 |  |
| 1.414999999999672 | -0.25 | 0.082 |  |
| 1.409999999999672 | -0.251 | 0.082 |  |
| 1.404999999999672 | -0.253 | 0.083 |  |
| 1.399999999999673 | -0.255 | 0.083 |  |
| 1.394999999999673 | -0.257 | 0.084 |  |
| 1.389999999999673 | -0.259 | 0.084 |  |
| 1.384999999999673 | -0.261 | 0.084 |  |
| 1.379999999999673 | -0.263 | 0.085 |  |
| 1.374999999999673 | -0.264 | 0.085 |  |
| 1.369999999999673 | -0.266 | 0.086 |  |
| 1.364999999999673 | -0.268 | 0.086 |  |
| 1.359999999999673 | -0.27 | 0.086 |  |
| 1.354999999999674 | -0.272 | 0.087 |  |
| 1.349999999999674 | -0.274 | 0.087 |  |
| 1.344999999999674 | -0.276 | 0.087 |  |
| 1.339999999999674 | -0.278 | 0.088 |  |
| 1.334999999999674 | -0.281 | 0.088 |  |
| 1.329999999999674 | -0.283 | 0.088 |  |
| 1.324999999999674 | -0.285 | 0.088 |  |
| 1.319999999999674 | -0.287 | 0.089 |  |
| 1.314999999999674 | -0.289 | 0.089 |  |
| 1.309999999999674 | -0.291 | 0.089 |  |
| 1.304999999999675 | -0.294 | 0.089 |  |
| 1.299999999999675 | -0.296 | 0.089 |  |
| 1.294999999999675 | -0.298 | 0.089 |  |
| 1.289999999999675 | -0.3 | 0.09 |  |
| 1.284999999999675 | -0.303 | 0.09 |  |
| 1.279999999999675 | -0.305 | 0.09 |  |
| 1.274999999999675 | -0.308 | 0.09 |  |
| 1.269999999999675 | -0.31 | 0.09 |  |
| 1.264999999999675 | -0.312 | 0.09 |  |
| 1.259999999999676 | -0.315 | 0.09 |  |
| 1.254999999999676 | -0.317 | 0.09 |  |
| 1.249999999999676 | -0.32 | 0.09 |  |
| 1.244999999999676 | -0.323 | 0.089 |  |
| 1.239999999999676 | -0.325 | 0.089 |  |
| 1.234999999999676 | -0.328 | 0.089 |  |
| 1.229999999999676 | -0.33 | 0.089 |  |
| 1.224999999999676 | -0.333 | 0.089 |  |
| 1.219999999999676 | -0.336 | 0.088 |  |
| 1.214999999999677 | -0.339 | 0.088 |  |
| 1.209999999999677 | -0.342 | 0.088 |  |
| 1.204999999999677 | -0.344 | 0.087 |  |
| 1.199999999999677 | -0.347 | 0.087 |  |
| 1.194999999999677 | -0.35 | 0.086 |  |
| 1.189999999999677 | -0.353 | 0.086 |  |
| 1.184999999999677 | -0.356 | 0.085 |  |
| 1.179999999999677 | -0.359 | 0.084 |  |
| 1.174999999999677 | -0.362 | 0.084 |  |
| 1.169999999999677 | -0.365 | 0.083 |  |
| 1.164999999999678 | -0.368 | 0.082 |  |
| 1.159999999999678 | -0.372 | 0.081 |  |
| 1.154999999999678 | -0.375 | 0.08 |  |
| 1.149999999999678 | -0.378 | 0.079 |  |
| 1.144999999999678 | -0.381 | 0.078 |  |
| 1.139999999999678 | -0.385 | 0.077 |  |
| 1.134999999999678 | -0.388 | 0.076 |  |
| 1.129999999999678 | -0.392 | 0.075 |  |
| 1.124999999999678 | -0.395 | 0.073 |  |
| 1.119999999999679 | -0.399 | 0.072 |  |
| 1.114999999999679 | -0.402 | 0.07 |  |
| 1.109999999999679 | -0.406 | 0.068 |  |
| 1.104999999999679 | -0.409 | 0.067 |  |
| 1.099999999999679 | -0.413 | 0.065 |  |
| 1.094999999999679 | -0.417 | 0.063 |  |
| 1.089999999999679 | -0.421 | 0.061 |  |
| 1.084999999999679 | -0.425 | 0.059 |  |
| 1.079999999999679 | -0.429 | 0.056 |  |
| 1.07499999999968 | -0.433 | 0.054 |  |
| 1.06999999999968 | -0.437 | 0.052 |  |
| 1.06499999999968 | -0.441 | 0.049 |  |
| 1.05999999999968 | -0.445 | 0.046 |  |
| 1.05499999999968 | -0.449 | 0.043 |  |
| 1.04999999999968 | -0.454 | 0.04 |  |
| 1.04499999999968 | -0.458 | 0.037 |  |
| 1.03999999999968 | -0.462 | 0.034 |  |
| 1.03499999999968 | -0.467 | 0.03 |  |
| 1.02999999999968 | -0.471 | 0.026 |  |
| 1.024999999999681 | -0.476 | 0.022 |  |
| 1.019999999999681 | -0.481 | 0.018 |  |
| 1.014999999999681 | -0.485 | 0.014 |  |
| 1.009999999999681 | -0.49 | 0.01 |  |
| 1.004999999999681 | -0.495 | 0.005 |  |
| 0.999999999999681 | -0.5 | 0 |  |